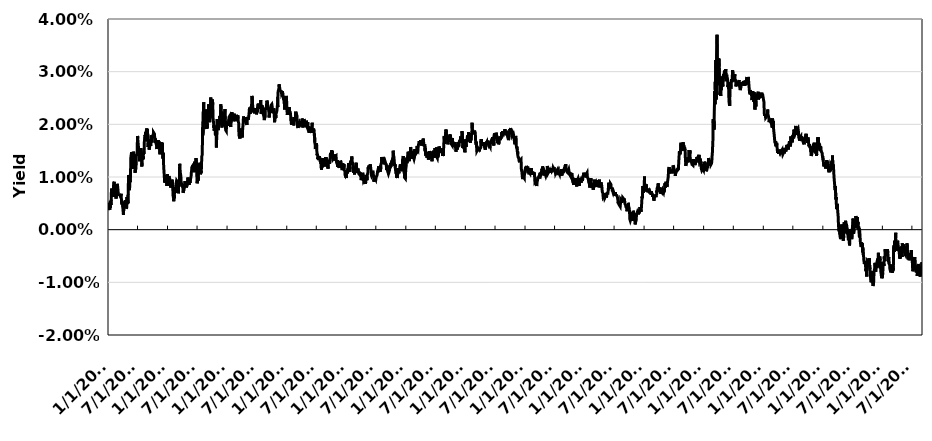
| Category | Spread |
|---|---|
| 1/4/10 | 0.004 |
| 1/5/10 | 0.005 |
| 1/6/10 | 0.004 |
| 1/7/10 | 0.004 |
| 1/8/10 | 0.005 |
| 1/11/10 | 0.004 |
| 1/12/10 | 0.005 |
| 1/13/10 | 0.004 |
| 1/14/10 | 0.005 |
| 1/15/10 | 0.005 |
| 1/19/10 | 0.005 |
| 1/20/10 | 0.006 |
| 1/21/10 | 0.007 |
| 1/22/10 | 0.008 |
| 1/25/10 | 0.007 |
| 1/26/10 | 0.007 |
| 1/27/10 | 0.007 |
| 1/28/10 | 0.008 |
| 1/29/10 | 0.008 |
| 2/1/10 | 0.007 |
| 2/2/10 | 0.006 |
| 2/3/10 | 0.006 |
| 2/4/10 | 0.008 |
| 2/5/10 | 0.009 |
| 2/8/10 | 0.009 |
| 2/9/10 | 0.008 |
| 2/10/10 | 0.008 |
| 2/11/10 | 0.008 |
| 2/12/10 | 0.008 |
| 2/16/10 | 0.008 |
| 2/17/10 | 0.007 |
| 2/18/10 | 0.006 |
| 2/19/10 | 0.006 |
| 2/22/10 | 0.006 |
| 2/23/10 | 0.007 |
| 2/24/10 | 0.007 |
| 2/25/10 | 0.008 |
| 2/26/10 | 0.009 |
| 3/1/10 | 0.008 |
| 3/2/10 | 0.008 |
| 3/3/10 | 0.008 |
| 3/4/10 | 0.008 |
| 3/5/10 | 0.007 |
| 3/8/10 | 0.006 |
| 3/9/10 | 0.007 |
| 3/10/10 | 0.006 |
| 3/11/10 | 0.006 |
| 3/12/10 | 0.007 |
| 3/15/10 | 0.006 |
| 3/16/10 | 0.006 |
| 3/17/10 | 0.006 |
| 3/18/10 | 0.006 |
| 3/19/10 | 0.006 |
| 3/22/10 | 0.007 |
| 3/23/10 | 0.006 |
| 3/24/10 | 0.005 |
| 3/25/10 | 0.005 |
| 3/26/10 | 0.005 |
| 3/29/10 | 0.005 |
| 3/30/10 | 0.005 |
| 3/31/10 | 0.005 |
| 4/1/10 | 0.004 |
| 4/5/10 | 0.003 |
| 4/6/10 | 0.003 |
| 4/7/10 | 0.004 |
| 4/8/10 | 0.004 |
| 4/9/10 | 0.004 |
| 4/12/10 | 0.004 |
| 4/13/10 | 0.005 |
| 4/14/10 | 0.004 |
| 4/15/10 | 0.004 |
| 4/16/10 | 0.006 |
| 4/19/10 | 0.005 |
| 4/20/10 | 0.005 |
| 4/21/10 | 0.005 |
| 4/22/10 | 0.005 |
| 4/23/10 | 0.004 |
| 4/26/10 | 0.004 |
| 4/27/10 | 0.006 |
| 4/28/10 | 0.005 |
| 4/29/10 | 0.005 |
| 4/30/10 | 0.006 |
| 5/3/10 | 0.005 |
| 5/4/10 | 0.007 |
| 5/5/10 | 0.008 |
| 5/6/10 | 0.01 |
| 5/7/10 | 0.01 |
| 5/10/10 | 0.008 |
| 5/11/10 | 0.008 |
| 5/12/10 | 0.008 |
| 5/13/10 | 0.008 |
| 5/14/10 | 0.009 |
| 5/17/10 | 0.009 |
| 5/18/10 | 0.01 |
| 5/19/10 | 0.011 |
| 5/20/10 | 0.013 |
| 5/21/10 | 0.014 |
| 5/24/10 | 0.014 |
| 5/25/10 | 0.015 |
| 5/26/10 | 0.015 |
| 5/27/10 | 0.012 |
| 5/28/10 | 0.013 |
| 6/1/10 | 0.014 |
| 6/2/10 | 0.012 |
| 6/3/10 | 0.012 |
| 6/4/10 | 0.015 |
| 6/7/10 | 0.015 |
| 6/8/10 | 0.014 |
| 6/9/10 | 0.014 |
| 6/10/10 | 0.012 |
| 6/11/10 | 0.013 |
| 6/14/10 | 0.012 |
| 6/15/10 | 0.011 |
| 6/16/10 | 0.011 |
| 6/17/10 | 0.011 |
| 6/18/10 | 0.011 |
| 6/21/10 | 0.011 |
| 6/22/10 | 0.013 |
| 6/23/10 | 0.014 |
| 6/24/10 | 0.014 |
| 6/25/10 | 0.014 |
| 6/28/10 | 0.015 |
| 6/29/10 | 0.016 |
| 6/30/10 | 0.017 |
| 7/1/10 | 0.018 |
| 7/2/10 | 0.017 |
| 7/6/10 | 0.017 |
| 7/7/10 | 0.015 |
| 7/8/10 | 0.015 |
| 7/9/10 | 0.014 |
| 7/12/10 | 0.014 |
| 7/13/10 | 0.013 |
| 7/14/10 | 0.014 |
| 7/15/10 | 0.014 |
| 7/16/10 | 0.015 |
| 7/19/10 | 0.014 |
| 7/20/10 | 0.014 |
| 7/21/10 | 0.016 |
| 7/22/10 | 0.014 |
| 7/23/10 | 0.014 |
| 7/26/10 | 0.013 |
| 7/27/10 | 0.012 |
| 7/28/10 | 0.013 |
| 7/29/10 | 0.014 |
| 7/30/10 | 0.015 |
| 8/2/10 | 0.013 |
| 8/3/10 | 0.014 |
| 8/4/10 | 0.013 |
| 8/5/10 | 0.014 |
| 8/6/10 | 0.015 |
| 8/9/10 | 0.014 |
| 8/10/10 | 0.015 |
| 8/11/10 | 0.017 |
| 8/12/10 | 0.017 |
| 8/13/10 | 0.017 |
| 8/16/10 | 0.018 |
| 8/17/10 | 0.017 |
| 8/18/10 | 0.017 |
| 8/19/10 | 0.018 |
| 8/20/10 | 0.018 |
| 8/23/10 | 0.018 |
| 8/24/10 | 0.019 |
| 8/25/10 | 0.019 |
| 8/26/10 | 0.019 |
| 8/27/10 | 0.017 |
| 8/30/10 | 0.019 |
| 8/31/10 | 0.019 |
| 9/1/10 | 0.017 |
| 9/2/10 | 0.017 |
| 9/3/10 | 0.016 |
| 9/7/10 | 0.017 |
| 9/8/10 | 0.017 |
| 9/9/10 | 0.015 |
| 9/10/10 | 0.015 |
| 9/13/10 | 0.016 |
| 9/14/10 | 0.016 |
| 9/15/10 | 0.016 |
| 9/16/10 | 0.016 |
| 9/17/10 | 0.016 |
| 9/20/10 | 0.016 |
| 9/21/10 | 0.017 |
| 9/22/10 | 0.017 |
| 9/23/10 | 0.018 |
| 9/24/10 | 0.017 |
| 9/27/10 | 0.017 |
| 9/28/10 | 0.018 |
| 9/29/10 | 0.018 |
| 9/30/10 | 0.018 |
| 10/1/10 | 0.017 |
| 10/4/10 | 0.018 |
| 10/5/10 | 0.017 |
| 10/6/10 | 0.018 |
| 10/7/10 | 0.018 |
| 10/8/10 | 0.018 |
| 10/12/10 | 0.018 |
| 10/13/10 | 0.018 |
| 10/14/10 | 0.017 |
| 10/15/10 | 0.016 |
| 10/18/10 | 0.017 |
| 10/19/10 | 0.017 |
| 10/20/10 | 0.017 |
| 10/21/10 | 0.016 |
| 10/22/10 | 0.016 |
| 10/25/10 | 0.017 |
| 10/26/10 | 0.016 |
| 10/27/10 | 0.015 |
| 10/28/10 | 0.016 |
| 10/29/10 | 0.016 |
| 11/1/10 | 0.016 |
| 11/2/10 | 0.016 |
| 11/3/10 | 0.016 |
| 11/4/10 | 0.017 |
| 11/5/10 | 0.017 |
| 11/8/10 | 0.017 |
| 11/9/10 | 0.016 |
| 11/10/10 | 0.017 |
| 11/11/10 | 0.017 |
| 11/12/10 | 0.016 |
| 11/15/10 | 0.014 |
| 11/16/10 | 0.016 |
| 11/17/10 | 0.015 |
| 11/18/10 | 0.015 |
| 11/19/10 | 0.015 |
| 11/22/10 | 0.016 |
| 11/23/10 | 0.017 |
| 11/24/10 | 0.015 |
| 11/26/10 | 0.016 |
| 11/29/10 | 0.016 |
| 11/30/10 | 0.016 |
| 12/1/10 | 0.014 |
| 12/2/10 | 0.014 |
| 12/3/10 | 0.014 |
| 12/6/10 | 0.015 |
| 12/7/10 | 0.013 |
| 12/8/10 | 0.012 |
| 12/9/10 | 0.012 |
| 12/10/10 | 0.011 |
| 12/13/10 | 0.011 |
| 12/14/10 | 0.009 |
| 12/15/10 | 0.009 |
| 12/16/10 | 0.009 |
| 12/17/10 | 0.01 |
| 12/20/10 | 0.01 |
| 12/21/10 | 0.01 |
| 12/22/10 | 0.01 |
| 12/23/10 | 0.009 |
| 12/27/10 | 0.01 |
| 12/28/10 | 0.008 |
| 12/29/10 | 0.01 |
| 12/30/10 | 0.01 |
| 12/31/10 | 0.01 |
| 1/3/11 | 0.01 |
| 1/4/11 | 0.01 |
| 1/5/11 | 0.008 |
| 1/6/11 | 0.009 |
| 1/7/11 | 0.01 |
| 1/10/11 | 0.01 |
| 1/11/11 | 0.01 |
| 1/12/11 | 0.009 |
| 1/13/11 | 0.01 |
| 1/14/11 | 0.009 |
| 1/18/11 | 0.009 |
| 1/19/11 | 0.009 |
| 1/20/11 | 0.008 |
| 1/21/11 | 0.008 |
| 1/24/11 | 0.008 |
| 1/25/11 | 0.009 |
| 1/26/11 | 0.008 |
| 1/27/11 | 0.008 |
| 1/28/11 | 0.01 |
| 1/31/11 | 0.009 |
| 2/1/11 | 0.008 |
| 2/2/11 | 0.008 |
| 2/3/11 | 0.007 |
| 2/4/11 | 0.006 |
| 2/7/11 | 0.006 |
| 2/8/11 | 0.005 |
| 2/9/11 | 0.006 |
| 2/10/11 | 0.006 |
| 2/11/11 | 0.007 |
| 2/14/11 | 0.007 |
| 2/15/11 | 0.007 |
| 2/16/11 | 0.007 |
| 2/17/11 | 0.008 |
| 2/18/11 | 0.007 |
| 2/22/11 | 0.009 |
| 2/23/11 | 0.009 |
| 2/24/11 | 0.009 |
| 2/25/11 | 0.009 |
| 2/28/11 | 0.009 |
| 3/1/11 | 0.009 |
| 3/2/11 | 0.009 |
| 3/3/11 | 0.007 |
| 3/4/11 | 0.008 |
| 3/7/11 | 0.008 |
| 3/8/11 | 0.007 |
| 3/9/11 | 0.007 |
| 3/10/11 | 0.009 |
| 3/11/11 | 0.008 |
| 3/14/11 | 0.009 |
| 3/15/11 | 0.011 |
| 3/16/11 | 0.012 |
| 3/17/11 | 0.012 |
| 3/18/11 | 0.012 |
| 3/21/11 | 0.01 |
| 3/22/11 | 0.01 |
| 3/23/11 | 0.01 |
| 3/24/11 | 0.01 |
| 3/25/11 | 0.009 |
| 3/28/11 | 0.009 |
| 3/29/11 | 0.008 |
| 3/30/11 | 0.008 |
| 3/31/11 | 0.008 |
| 4/1/11 | 0.008 |
| 4/4/11 | 0.008 |
| 4/5/11 | 0.008 |
| 4/6/11 | 0.007 |
| 4/7/11 | 0.007 |
| 4/8/11 | 0.007 |
| 4/11/11 | 0.008 |
| 4/12/11 | 0.008 |
| 4/13/11 | 0.009 |
| 4/14/11 | 0.008 |
| 4/15/11 | 0.008 |
| 4/18/11 | 0.009 |
| 4/19/11 | 0.009 |
| 4/20/11 | 0.008 |
| 4/21/11 | 0.008 |
| 4/25/11 | 0.009 |
| 4/26/11 | 0.009 |
| 4/27/11 | 0.008 |
| 4/28/11 | 0.008 |
| 4/29/11 | 0.008 |
| 5/2/11 | 0.008 |
| 5/3/11 | 0.008 |
| 5/4/11 | 0.009 |
| 5/5/11 | 0.01 |
| 5/6/11 | 0.01 |
| 5/9/11 | 0.01 |
| 5/10/11 | 0.009 |
| 5/11/11 | 0.009 |
| 5/12/11 | 0.008 |
| 5/13/11 | 0.009 |
| 5/16/11 | 0.009 |
| 5/17/11 | 0.009 |
| 5/18/11 | 0.009 |
| 5/19/11 | 0.009 |
| 5/20/11 | 0.009 |
| 5/23/11 | 0.01 |
| 5/24/11 | 0.01 |
| 5/25/11 | 0.01 |
| 5/26/11 | 0.011 |
| 5/27/11 | 0.011 |
| 5/31/11 | 0.011 |
| 6/1/11 | 0.012 |
| 6/2/11 | 0.011 |
| 6/3/11 | 0.012 |
| 6/6/11 | 0.012 |
| 6/7/11 | 0.012 |
| 6/8/11 | 0.012 |
| 6/9/11 | 0.012 |
| 6/10/11 | 0.012 |
| 6/13/11 | 0.012 |
| 6/14/11 | 0.011 |
| 6/15/11 | 0.013 |
| 6/16/11 | 0.013 |
| 6/17/11 | 0.013 |
| 6/20/11 | 0.012 |
| 6/21/11 | 0.012 |
| 6/22/11 | 0.012 |
| 6/23/11 | 0.013 |
| 6/24/11 | 0.014 |
| 6/27/11 | 0.012 |
| 6/28/11 | 0.011 |
| 6/29/11 | 0.01 |
| 6/30/11 | 0.01 |
| 7/1/11 | 0.009 |
| 7/5/11 | 0.01 |
| 7/6/11 | 0.01 |
| 7/7/11 | 0.009 |
| 7/8/11 | 0.011 |
| 7/11/11 | 0.012 |
| 7/12/11 | 0.012 |
| 7/13/11 | 0.012 |
| 7/14/11 | 0.012 |
| 7/15/11 | 0.012 |
| 7/18/11 | 0.013 |
| 7/19/11 | 0.013 |
| 7/20/11 | 0.012 |
| 7/21/11 | 0.011 |
| 7/22/11 | 0.011 |
| 7/25/11 | 0.011 |
| 7/26/11 | 0.011 |
| 7/27/11 | 0.011 |
| 7/28/11 | 0.012 |
| 7/29/11 | 0.014 |
| 8/1/11 | 0.014 |
| 8/2/11 | 0.016 |
| 8/3/11 | 0.016 |
| 8/4/11 | 0.019 |
| 8/5/11 | 0.018 |
| 8/8/11 | 0.022 |
| 8/9/11 | 0.023 |
| 8/10/11 | 0.024 |
| 8/11/11 | 0.021 |
| 8/12/11 | 0.022 |
| 8/15/11 | 0.02 |
| 8/16/11 | 0.021 |
| 8/17/11 | 0.021 |
| 8/18/11 | 0.022 |
| 8/19/11 | 0.023 |
| 8/22/11 | 0.022 |
| 8/23/11 | 0.021 |
| 8/24/11 | 0.019 |
| 8/25/11 | 0.02 |
| 8/26/11 | 0.021 |
| 8/29/11 | 0.019 |
| 8/30/11 | 0.02 |
| 8/31/11 | 0.019 |
| 9/1/11 | 0.02 |
| 9/2/11 | 0.022 |
| 9/6/11 | 0.023 |
| 9/7/11 | 0.022 |
| 9/8/11 | 0.022 |
| 9/9/11 | 0.024 |
| 9/12/11 | 0.023 |
| 9/13/11 | 0.023 |
| 9/14/11 | 0.022 |
| 9/15/11 | 0.021 |
| 9/16/11 | 0.02 |
| 9/19/11 | 0.022 |
| 9/20/11 | 0.021 |
| 9/21/11 | 0.023 |
| 9/22/11 | 0.025 |
| 9/23/11 | 0.024 |
| 9/26/11 | 0.022 |
| 9/27/11 | 0.022 |
| 9/28/11 | 0.022 |
| 9/29/11 | 0.021 |
| 9/30/11 | 0.023 |
| 10/3/11 | 0.025 |
| 10/4/11 | 0.025 |
| 10/5/11 | 0.024 |
| 10/6/11 | 0.022 |
| 10/7/11 | 0.021 |
| 10/11/11 | 0.02 |
| 10/12/11 | 0.019 |
| 10/13/11 | 0.02 |
| 10/14/11 | 0.019 |
| 10/17/11 | 0.02 |
| 10/18/11 | 0.019 |
| 10/19/11 | 0.019 |
| 10/20/11 | 0.019 |
| 10/21/11 | 0.018 |
| 10/24/11 | 0.018 |
| 10/25/11 | 0.019 |
| 10/26/11 | 0.018 |
| 10/27/11 | 0.016 |
| 10/28/11 | 0.017 |
| 10/31/11 | 0.019 |
| 11/1/11 | 0.021 |
| 11/2/11 | 0.02 |
| 11/3/11 | 0.019 |
| 11/4/11 | 0.02 |
| 11/7/11 | 0.02 |
| 11/8/11 | 0.019 |
| 11/9/11 | 0.021 |
| 11/10/11 | 0.02 |
| 11/14/11 | 0.02 |
| 11/15/11 | 0.02 |
| 11/16/11 | 0.021 |
| 11/17/11 | 0.022 |
| 11/18/11 | 0.021 |
| 11/21/11 | 0.022 |
| 11/22/11 | 0.023 |
| 11/23/11 | 0.024 |
| 11/25/11 | 0.023 |
| 11/28/11 | 0.022 |
| 11/29/11 | 0.021 |
| 11/30/11 | 0.02 |
| 12/1/11 | 0.019 |
| 12/2/11 | 0.02 |
| 12/5/11 | 0.02 |
| 12/6/11 | 0.02 |
| 12/7/11 | 0.02 |
| 12/8/11 | 0.021 |
| 12/9/11 | 0.02 |
| 12/12/11 | 0.021 |
| 12/13/11 | 0.021 |
| 12/14/11 | 0.022 |
| 12/15/11 | 0.021 |
| 12/16/11 | 0.022 |
| 12/19/11 | 0.023 |
| 12/20/11 | 0.021 |
| 12/21/11 | 0.02 |
| 12/22/11 | 0.02 |
| 12/23/11 | 0.019 |
| 12/27/11 | 0.019 |
| 12/28/11 | 0.02 |
| 12/29/11 | 0.02 |
| 12/30/11 | 0.02 |
| 1/3/12 | 0.02 |
| 1/4/12 | 0.02 |
| 1/5/12 | 0.02 |
| 1/6/12 | 0.02 |
| 1/9/12 | 0.02 |
| 1/10/12 | 0.02 |
| 1/11/12 | 0.021 |
| 1/12/12 | 0.021 |
| 1/13/12 | 0.021 |
| 1/17/12 | 0.022 |
| 1/18/12 | 0.021 |
| 1/19/12 | 0.021 |
| 1/20/12 | 0.02 |
| 1/23/12 | 0.02 |
| 1/24/12 | 0.02 |
| 1/25/12 | 0.02 |
| 1/26/12 | 0.02 |
| 1/27/12 | 0.021 |
| 1/30/12 | 0.022 |
| 1/31/12 | 0.022 |
| 2/1/12 | 0.022 |
| 2/2/12 | 0.022 |
| 2/3/12 | 0.021 |
| 2/6/12 | 0.022 |
| 2/7/12 | 0.021 |
| 2/8/12 | 0.021 |
| 2/9/12 | 0.021 |
| 2/10/12 | 0.022 |
| 2/13/12 | 0.021 |
| 2/14/12 | 0.022 |
| 2/15/12 | 0.022 |
| 2/16/12 | 0.021 |
| 2/17/12 | 0.021 |
| 2/21/12 | 0.021 |
| 2/22/12 | 0.021 |
| 2/23/12 | 0.021 |
| 2/24/12 | 0.021 |
| 2/27/12 | 0.022 |
| 2/28/12 | 0.022 |
| 2/29/12 | 0.022 |
| 3/1/12 | 0.021 |
| 3/2/12 | 0.021 |
| 3/5/12 | 0.021 |
| 3/6/12 | 0.022 |
| 3/7/12 | 0.022 |
| 3/8/12 | 0.021 |
| 3/9/12 | 0.021 |
| 3/12/12 | 0.02 |
| 3/13/12 | 0.019 |
| 3/14/12 | 0.018 |
| 3/15/12 | 0.018 |
| 3/16/12 | 0.018 |
| 3/19/12 | 0.017 |
| 3/20/12 | 0.017 |
| 3/21/12 | 0.018 |
| 3/22/12 | 0.018 |
| 3/23/12 | 0.019 |
| 3/26/12 | 0.018 |
| 3/27/12 | 0.019 |
| 3/28/12 | 0.019 |
| 3/29/12 | 0.019 |
| 3/30/12 | 0.018 |
| 4/2/12 | 0.018 |
| 4/3/12 | 0.018 |
| 4/4/12 | 0.018 |
| 4/5/12 | 0.019 |
| 4/9/12 | 0.021 |
| 4/10/12 | 0.022 |
| 4/11/12 | 0.021 |
| 4/12/12 | 0.02 |
| 4/13/12 | 0.021 |
| 4/16/12 | 0.021 |
| 4/17/12 | 0.021 |
| 4/18/12 | 0.021 |
| 4/19/12 | 0.021 |
| 4/20/12 | 0.021 |
| 4/23/12 | 0.021 |
| 4/24/12 | 0.021 |
| 4/25/12 | 0.02 |
| 4/26/12 | 0.02 |
| 4/27/12 | 0.02 |
| 4/30/12 | 0.02 |
| 5/1/12 | 0.02 |
| 5/2/12 | 0.02 |
| 5/3/12 | 0.021 |
| 5/4/12 | 0.021 |
| 5/7/12 | 0.021 |
| 5/8/12 | 0.021 |
| 5/9/12 | 0.021 |
| 5/10/12 | 0.021 |
| 5/11/12 | 0.021 |
| 5/14/12 | 0.022 |
| 5/15/12 | 0.022 |
| 5/16/12 | 0.022 |
| 5/17/12 | 0.023 |
| 5/18/12 | 0.023 |
| 5/21/12 | 0.023 |
| 5/22/12 | 0.022 |
| 5/23/12 | 0.023 |
| 5/24/12 | 0.022 |
| 5/25/12 | 0.022 |
| 5/29/12 | 0.022 |
| 5/30/12 | 0.024 |
| 5/31/12 | 0.024 |
| 6/1/12 | 0.025 |
| 6/4/12 | 0.025 |
| 6/5/12 | 0.024 |
| 6/6/12 | 0.023 |
| 6/7/12 | 0.023 |
| 6/8/12 | 0.022 |
| 6/11/12 | 0.023 |
| 6/12/12 | 0.022 |
| 6/13/12 | 0.023 |
| 6/14/12 | 0.022 |
| 6/15/12 | 0.022 |
| 6/18/12 | 0.022 |
| 6/19/12 | 0.022 |
| 6/20/12 | 0.022 |
| 6/21/12 | 0.023 |
| 6/22/12 | 0.022 |
| 6/25/12 | 0.023 |
| 6/26/12 | 0.023 |
| 6/27/12 | 0.022 |
| 6/28/12 | 0.023 |
| 6/29/12 | 0.022 |
| 7/2/12 | 0.023 |
| 7/3/12 | 0.022 |
| 7/5/12 | 0.023 |
| 7/6/12 | 0.023 |
| 7/9/12 | 0.024 |
| 7/10/12 | 0.024 |
| 7/11/12 | 0.024 |
| 7/12/12 | 0.024 |
| 7/13/12 | 0.023 |
| 7/16/12 | 0.024 |
| 7/17/12 | 0.023 |
| 7/18/12 | 0.023 |
| 7/19/12 | 0.023 |
| 7/20/12 | 0.023 |
| 7/23/12 | 0.024 |
| 7/24/12 | 0.024 |
| 7/25/12 | 0.025 |
| 7/26/12 | 0.024 |
| 7/27/12 | 0.022 |
| 7/30/12 | 0.022 |
| 7/31/12 | 0.023 |
| 8/1/12 | 0.023 |
| 8/2/12 | 0.024 |
| 8/3/12 | 0.022 |
| 8/6/12 | 0.022 |
| 8/7/12 | 0.022 |
| 8/8/12 | 0.022 |
| 8/9/12 | 0.022 |
| 8/10/12 | 0.022 |
| 8/13/12 | 0.022 |
| 8/14/12 | 0.022 |
| 8/15/12 | 0.021 |
| 8/16/12 | 0.021 |
| 8/17/12 | 0.021 |
| 8/20/12 | 0.021 |
| 8/21/12 | 0.021 |
| 8/22/12 | 0.022 |
| 8/23/12 | 0.023 |
| 8/24/12 | 0.023 |
| 8/27/12 | 0.023 |
| 8/28/12 | 0.023 |
| 8/29/12 | 0.023 |
| 8/30/12 | 0.024 |
| 8/31/12 | 0.024 |
| 9/4/12 | 0.024 |
| 9/5/12 | 0.024 |
| 9/6/12 | 0.023 |
| 9/7/12 | 0.023 |
| 9/10/12 | 0.023 |
| 9/11/12 | 0.023 |
| 9/12/12 | 0.023 |
| 9/13/12 | 0.022 |
| 9/14/12 | 0.021 |
| 9/17/12 | 0.022 |
| 9/18/12 | 0.022 |
| 9/19/12 | 0.023 |
| 9/20/12 | 0.022 |
| 9/21/12 | 0.023 |
| 9/24/12 | 0.023 |
| 9/25/12 | 0.023 |
| 9/26/12 | 0.024 |
| 9/27/12 | 0.024 |
| 9/28/12 | 0.024 |
| 10/1/12 | 0.024 |
| 10/2/12 | 0.024 |
| 10/3/12 | 0.023 |
| 10/4/12 | 0.023 |
| 10/5/12 | 0.022 |
| 10/9/12 | 0.022 |
| 10/10/12 | 0.022 |
| 10/11/12 | 0.023 |
| 10/12/12 | 0.023 |
| 10/15/12 | 0.023 |
| 10/16/12 | 0.022 |
| 10/17/12 | 0.021 |
| 10/18/12 | 0.02 |
| 10/19/12 | 0.021 |
| 10/22/12 | 0.021 |
| 10/23/12 | 0.022 |
| 10/24/12 | 0.022 |
| 10/25/12 | 0.021 |
| 10/26/12 | 0.022 |
| 10/31/12 | 0.022 |
| 11/1/12 | 0.023 |
| 11/2/12 | 0.023 |
| 11/5/12 | 0.024 |
| 11/6/12 | 0.023 |
| 11/7/12 | 0.025 |
| 11/8/12 | 0.026 |
| 11/9/12 | 0.026 |
| 11/13/12 | 0.027 |
| 11/14/12 | 0.027 |
| 11/15/12 | 0.028 |
| 11/16/12 | 0.027 |
| 11/19/12 | 0.027 |
| 11/20/12 | 0.026 |
| 11/21/12 | 0.026 |
| 11/23/12 | 0.026 |
| 11/26/12 | 0.026 |
| 11/27/12 | 0.026 |
| 11/28/12 | 0.026 |
| 11/29/12 | 0.026 |
| 11/30/12 | 0.026 |
| 12/3/12 | 0.026 |
| 12/4/12 | 0.026 |
| 12/5/12 | 0.026 |
| 12/6/12 | 0.026 |
| 12/7/12 | 0.026 |
| 12/10/12 | 0.026 |
| 12/11/12 | 0.025 |
| 12/12/12 | 0.025 |
| 12/13/12 | 0.025 |
| 12/14/12 | 0.025 |
| 12/17/12 | 0.024 |
| 12/18/12 | 0.023 |
| 12/19/12 | 0.023 |
| 12/20/12 | 0.023 |
| 12/21/12 | 0.024 |
| 12/24/12 | 0.024 |
| 12/26/12 | 0.024 |
| 12/27/12 | 0.025 |
| 12/28/12 | 0.025 |
| 12/31/12 | 0.024 |
| 1/2/13 | 0.023 |
| 1/3/13 | 0.022 |
| 1/4/13 | 0.022 |
| 1/7/13 | 0.022 |
| 1/8/13 | 0.023 |
| 1/9/13 | 0.023 |
| 1/10/13 | 0.022 |
| 1/11/13 | 0.023 |
| 1/14/13 | 0.023 |
| 1/15/13 | 0.023 |
| 1/16/13 | 0.023 |
| 1/17/13 | 0.023 |
| 1/18/13 | 0.022 |
| 1/22/13 | 0.022 |
| 1/23/13 | 0.022 |
| 1/24/13 | 0.022 |
| 1/25/13 | 0.021 |
| 1/28/13 | 0.021 |
| 1/29/13 | 0.02 |
| 1/30/13 | 0.02 |
| 1/31/13 | 0.02 |
| 2/1/13 | 0.02 |
| 2/4/13 | 0.021 |
| 2/5/13 | 0.02 |
| 2/6/13 | 0.02 |
| 2/7/13 | 0.02 |
| 2/8/13 | 0.02 |
| 2/11/13 | 0.02 |
| 2/12/13 | 0.02 |
| 2/13/13 | 0.02 |
| 2/14/13 | 0.021 |
| 2/15/13 | 0.021 |
| 2/19/13 | 0.021 |
| 2/20/13 | 0.021 |
| 2/21/13 | 0.021 |
| 2/22/13 | 0.021 |
| 2/25/13 | 0.022 |
| 2/26/13 | 0.022 |
| 2/27/13 | 0.022 |
| 2/28/13 | 0.022 |
| 3/1/13 | 0.022 |
| 3/4/13 | 0.021 |
| 3/5/13 | 0.021 |
| 3/6/13 | 0.021 |
| 3/7/13 | 0.02 |
| 3/8/13 | 0.02 |
| 3/11/13 | 0.019 |
| 3/12/13 | 0.02 |
| 3/13/13 | 0.02 |
| 3/14/13 | 0.02 |
| 3/15/13 | 0.02 |
| 3/18/13 | 0.02 |
| 3/19/13 | 0.021 |
| 3/20/13 | 0.02 |
| 3/21/13 | 0.02 |
| 3/22/13 | 0.02 |
| 3/25/13 | 0.021 |
| 3/26/13 | 0.02 |
| 3/27/13 | 0.021 |
| 3/28/13 | 0.02 |
| 4/1/13 | 0.02 |
| 4/2/13 | 0.02 |
| 4/3/13 | 0.02 |
| 4/4/13 | 0.021 |
| 4/5/13 | 0.021 |
| 4/8/13 | 0.02 |
| 4/9/13 | 0.02 |
| 4/10/13 | 0.019 |
| 4/11/13 | 0.019 |
| 4/12/13 | 0.02 |
| 4/15/13 | 0.021 |
| 4/16/13 | 0.02 |
| 4/17/13 | 0.021 |
| 4/18/13 | 0.021 |
| 4/19/13 | 0.02 |
| 4/22/13 | 0.02 |
| 4/23/13 | 0.02 |
| 4/24/13 | 0.02 |
| 4/25/13 | 0.02 |
| 4/26/13 | 0.02 |
| 4/29/13 | 0.02 |
| 4/30/13 | 0.02 |
| 5/1/13 | 0.02 |
| 5/2/13 | 0.021 |
| 5/3/13 | 0.02 |
| 5/6/13 | 0.02 |
| 5/7/13 | 0.019 |
| 5/8/13 | 0.02 |
| 5/9/13 | 0.02 |
| 5/10/13 | 0.019 |
| 5/13/13 | 0.019 |
| 5/14/13 | 0.019 |
| 5/15/13 | 0.019 |
| 5/16/13 | 0.02 |
| 5/17/13 | 0.018 |
| 5/20/13 | 0.018 |
| 5/21/13 | 0.019 |
| 5/22/13 | 0.018 |
| 5/23/13 | 0.019 |
| 5/24/13 | 0.019 |
| 5/28/13 | 0.018 |
| 5/29/13 | 0.019 |
| 5/30/13 | 0.019 |
| 5/31/13 | 0.019 |
| 6/3/13 | 0.019 |
| 6/4/13 | 0.019 |
| 6/5/13 | 0.02 |
| 6/6/13 | 0.02 |
| 6/7/13 | 0.019 |
| 6/10/13 | 0.018 |
| 6/11/13 | 0.019 |
| 6/12/13 | 0.019 |
| 6/13/13 | 0.019 |
| 6/14/13 | 0.019 |
| 6/17/13 | 0.019 |
| 6/18/13 | 0.018 |
| 6/19/13 | 0.018 |
| 6/20/13 | 0.018 |
| 6/21/13 | 0.017 |
| 6/24/13 | 0.016 |
| 6/25/13 | 0.015 |
| 6/26/13 | 0.015 |
| 6/27/13 | 0.016 |
| 6/28/13 | 0.015 |
| 7/1/13 | 0.016 |
| 7/2/13 | 0.016 |
| 7/3/13 | 0.016 |
| 7/5/13 | 0.014 |
| 7/8/13 | 0.014 |
| 7/9/13 | 0.014 |
| 7/10/13 | 0.013 |
| 7/11/13 | 0.014 |
| 7/12/13 | 0.013 |
| 7/15/13 | 0.013 |
| 7/16/13 | 0.014 |
| 7/17/13 | 0.014 |
| 7/18/13 | 0.013 |
| 7/19/13 | 0.014 |
| 7/22/13 | 0.014 |
| 7/23/13 | 0.014 |
| 7/24/13 | 0.013 |
| 7/25/13 | 0.013 |
| 7/26/13 | 0.013 |
| 7/29/13 | 0.013 |
| 7/30/13 | 0.012 |
| 7/31/13 | 0.013 |
| 8/1/13 | 0.011 |
| 8/2/13 | 0.013 |
| 8/5/13 | 0.012 |
| 8/6/13 | 0.013 |
| 8/7/13 | 0.013 |
| 8/8/13 | 0.013 |
| 8/9/13 | 0.014 |
| 8/12/13 | 0.013 |
| 8/13/13 | 0.012 |
| 8/14/13 | 0.013 |
| 8/15/13 | 0.013 |
| 8/16/13 | 0.012 |
| 8/19/13 | 0.012 |
| 8/20/13 | 0.013 |
| 8/21/13 | 0.013 |
| 8/22/13 | 0.012 |
| 8/23/13 | 0.012 |
| 8/26/13 | 0.013 |
| 8/27/13 | 0.014 |
| 8/28/13 | 0.013 |
| 8/29/13 | 0.014 |
| 8/30/13 | 0.013 |
| 9/3/13 | 0.013 |
| 9/4/13 | 0.013 |
| 9/5/13 | 0.012 |
| 9/6/13 | 0.012 |
| 9/9/13 | 0.013 |
| 9/10/13 | 0.012 |
| 9/11/13 | 0.012 |
| 9/12/13 | 0.013 |
| 9/13/13 | 0.013 |
| 9/16/13 | 0.013 |
| 9/17/13 | 0.013 |
| 9/18/13 | 0.013 |
| 9/19/13 | 0.012 |
| 9/20/13 | 0.013 |
| 9/23/13 | 0.013 |
| 9/24/13 | 0.014 |
| 9/25/13 | 0.014 |
| 9/26/13 | 0.014 |
| 9/27/13 | 0.015 |
| 9/30/13 | 0.015 |
| 10/1/13 | 0.014 |
| 10/2/13 | 0.015 |
| 10/3/13 | 0.015 |
| 10/4/13 | 0.015 |
| 10/7/13 | 0.015 |
| 10/8/13 | 0.015 |
| 10/9/13 | 0.014 |
| 10/10/13 | 0.013 |
| 10/11/13 | 0.013 |
| 10/15/13 | 0.013 |
| 10/16/13 | 0.014 |
| 10/17/13 | 0.014 |
| 10/18/13 | 0.014 |
| 10/21/13 | 0.014 |
| 10/22/13 | 0.014 |
| 10/23/13 | 0.014 |
| 10/24/13 | 0.014 |
| 10/25/13 | 0.014 |
| 10/28/13 | 0.014 |
| 10/29/13 | 0.014 |
| 10/30/13 | 0.014 |
| 10/31/13 | 0.014 |
| 11/1/13 | 0.013 |
| 11/4/13 | 0.013 |
| 11/5/13 | 0.013 |
| 11/6/13 | 0.012 |
| 11/7/13 | 0.013 |
| 11/8/13 | 0.012 |
| 11/12/13 | 0.012 |
| 11/13/13 | 0.012 |
| 11/14/13 | 0.012 |
| 11/15/13 | 0.012 |
| 11/18/13 | 0.012 |
| 11/19/13 | 0.012 |
| 11/20/13 | 0.012 |
| 11/21/13 | 0.012 |
| 11/22/13 | 0.012 |
| 11/25/13 | 0.012 |
| 11/26/13 | 0.013 |
| 11/27/13 | 0.013 |
| 11/29/13 | 0.013 |
| 12/2/13 | 0.012 |
| 12/3/13 | 0.012 |
| 12/4/13 | 0.012 |
| 12/5/13 | 0.012 |
| 12/6/13 | 0.011 |
| 12/9/13 | 0.012 |
| 12/10/13 | 0.013 |
| 12/11/13 | 0.013 |
| 12/12/13 | 0.012 |
| 12/13/13 | 0.012 |
| 12/16/13 | 0.012 |
| 12/17/13 | 0.012 |
| 12/18/13 | 0.011 |
| 12/19/13 | 0.011 |
| 12/20/13 | 0.011 |
| 12/23/13 | 0.011 |
| 12/24/13 | 0.01 |
| 12/26/13 | 0.011 |
| 12/27/13 | 0.01 |
| 12/30/13 | 0.01 |
| 12/31/13 | 0.01 |
| 1/2/14 | 0.011 |
| 1/3/14 | 0.011 |
| 1/6/14 | 0.011 |
| 1/7/14 | 0.011 |
| 1/8/14 | 0.011 |
| 1/9/14 | 0.011 |
| 1/10/14 | 0.011 |
| 1/13/14 | 0.012 |
| 1/14/14 | 0.013 |
| 1/15/14 | 0.011 |
| 1/16/14 | 0.012 |
| 1/17/14 | 0.012 |
| 1/21/14 | 0.011 |
| 1/22/14 | 0.011 |
| 1/23/14 | 0.012 |
| 1/24/14 | 0.013 |
| 1/27/14 | 0.012 |
| 1/28/14 | 0.012 |
| 1/29/14 | 0.013 |
| 1/30/14 | 0.012 |
| 1/31/14 | 0.012 |
| 2/3/14 | 0.014 |
| 2/4/14 | 0.014 |
| 2/5/14 | 0.013 |
| 2/6/14 | 0.013 |
| 2/7/14 | 0.013 |
| 2/10/14 | 0.013 |
| 2/11/14 | 0.012 |
| 2/12/14 | 0.011 |
| 2/13/14 | 0.011 |
| 2/14/14 | 0.011 |
| 2/18/14 | 0.011 |
| 2/19/14 | 0.011 |
| 2/20/14 | 0.011 |
| 2/21/14 | 0.011 |
| 2/24/14 | 0.011 |
| 2/25/14 | 0.011 |
| 2/26/14 | 0.012 |
| 2/27/14 | 0.012 |
| 2/28/14 | 0.012 |
| 3/3/14 | 0.013 |
| 3/4/14 | 0.011 |
| 3/5/14 | 0.012 |
| 3/6/14 | 0.012 |
| 3/7/14 | 0.011 |
| 3/10/14 | 0.011 |
| 3/11/14 | 0.011 |
| 3/12/14 | 0.011 |
| 3/13/14 | 0.012 |
| 3/14/14 | 0.012 |
| 3/17/14 | 0.011 |
| 3/18/14 | 0.011 |
| 3/19/14 | 0.011 |
| 3/20/14 | 0.01 |
| 3/21/14 | 0.011 |
| 3/24/14 | 0.011 |
| 3/25/14 | 0.01 |
| 3/26/14 | 0.011 |
| 3/27/14 | 0.011 |
| 3/28/14 | 0.01 |
| 3/31/14 | 0.01 |
| 4/1/14 | 0.01 |
| 4/2/14 | 0.009 |
| 4/3/14 | 0.01 |
| 4/4/14 | 0.01 |
| 4/7/14 | 0.01 |
| 4/8/14 | 0.01 |
| 4/9/14 | 0.01 |
| 4/10/14 | 0.011 |
| 4/11/14 | 0.011 |
| 4/14/14 | 0.01 |
| 4/15/14 | 0.01 |
| 4/16/14 | 0.01 |
| 4/17/14 | 0.009 |
| 4/21/14 | 0.009 |
| 4/22/14 | 0.009 |
| 4/23/14 | 0.009 |
| 4/24/14 | 0.009 |
| 4/25/14 | 0.009 |
| 4/28/14 | 0.009 |
| 4/29/14 | 0.009 |
| 4/30/14 | 0.009 |
| 5/1/14 | 0.009 |
| 5/2/14 | 0.01 |
| 5/5/14 | 0.01 |
| 5/6/14 | 0.01 |
| 5/7/14 | 0.009 |
| 5/8/14 | 0.01 |
| 5/9/14 | 0.01 |
| 5/12/14 | 0.01 |
| 5/13/14 | 0.011 |
| 5/14/14 | 0.011 |
| 5/15/14 | 0.012 |
| 5/16/14 | 0.012 |
| 5/19/14 | 0.012 |
| 5/20/14 | 0.012 |
| 5/21/14 | 0.012 |
| 5/22/14 | 0.012 |
| 5/23/14 | 0.012 |
| 5/27/14 | 0.012 |
| 5/28/14 | 0.012 |
| 5/29/14 | 0.012 |
| 5/30/14 | 0.012 |
| 6/2/14 | 0.011 |
| 6/3/14 | 0.01 |
| 6/4/14 | 0.01 |
| 6/5/14 | 0.01 |
| 6/6/14 | 0.01 |
| 6/9/14 | 0.01 |
| 6/10/14 | 0.01 |
| 6/11/14 | 0.011 |
| 6/12/14 | 0.011 |
| 6/13/14 | 0.011 |
| 6/16/14 | 0.01 |
| 6/17/14 | 0.01 |
| 6/18/14 | 0.01 |
| 6/19/14 | 0.009 |
| 6/20/14 | 0.009 |
| 6/23/14 | 0.009 |
| 6/24/14 | 0.01 |
| 6/25/14 | 0.01 |
| 6/26/14 | 0.01 |
| 6/27/14 | 0.01 |
| 6/30/14 | 0.01 |
| 7/1/14 | 0.01 |
| 7/2/14 | 0.01 |
| 7/3/14 | 0.01 |
| 7/7/14 | 0.01 |
| 7/8/14 | 0.01 |
| 7/9/14 | 0.011 |
| 7/10/14 | 0.011 |
| 7/11/14 | 0.011 |
| 7/14/14 | 0.011 |
| 7/15/14 | 0.011 |
| 7/16/14 | 0.011 |
| 7/17/14 | 0.012 |
| 7/18/14 | 0.011 |
| 7/21/14 | 0.012 |
| 7/22/14 | 0.012 |
| 7/23/14 | 0.012 |
| 7/24/14 | 0.011 |
| 7/25/14 | 0.012 |
| 7/28/14 | 0.011 |
| 7/29/14 | 0.012 |
| 7/30/14 | 0.011 |
| 7/31/14 | 0.012 |
| 8/1/14 | 0.012 |
| 8/4/14 | 0.013 |
| 8/5/14 | 0.013 |
| 8/6/14 | 0.014 |
| 8/7/14 | 0.014 |
| 8/8/14 | 0.013 |
| 8/11/14 | 0.013 |
| 8/12/14 | 0.013 |
| 8/13/14 | 0.013 |
| 8/14/14 | 0.013 |
| 8/15/14 | 0.014 |
| 8/18/14 | 0.013 |
| 8/19/14 | 0.013 |
| 8/20/14 | 0.012 |
| 8/21/14 | 0.012 |
| 8/22/14 | 0.013 |
| 8/25/14 | 0.013 |
| 8/26/14 | 0.013 |
| 8/27/14 | 0.013 |
| 8/28/14 | 0.013 |
| 8/29/14 | 0.013 |
| 9/2/14 | 0.012 |
| 9/3/14 | 0.012 |
| 9/4/14 | 0.012 |
| 9/5/14 | 0.011 |
| 9/8/14 | 0.011 |
| 9/9/14 | 0.012 |
| 9/10/14 | 0.011 |
| 9/11/14 | 0.011 |
| 9/12/14 | 0.011 |
| 9/15/14 | 0.011 |
| 9/16/14 | 0.011 |
| 9/17/14 | 0.01 |
| 9/18/14 | 0.011 |
| 9/19/14 | 0.011 |
| 9/22/14 | 0.011 |
| 9/23/14 | 0.012 |
| 9/24/14 | 0.012 |
| 9/25/14 | 0.012 |
| 9/26/14 | 0.012 |
| 9/29/14 | 0.012 |
| 9/30/14 | 0.012 |
| 10/1/14 | 0.013 |
| 10/2/14 | 0.013 |
| 10/3/14 | 0.012 |
| 10/6/14 | 0.012 |
| 10/7/14 | 0.013 |
| 10/8/14 | 0.012 |
| 10/9/14 | 0.013 |
| 10/10/14 | 0.013 |
| 10/14/14 | 0.014 |
| 10/15/14 | 0.015 |
| 10/16/14 | 0.015 |
| 10/17/14 | 0.014 |
| 10/20/14 | 0.014 |
| 10/21/14 | 0.013 |
| 10/22/14 | 0.013 |
| 10/23/14 | 0.012 |
| 10/24/14 | 0.012 |
| 10/27/14 | 0.012 |
| 10/28/14 | 0.012 |
| 10/29/14 | 0.012 |
| 10/30/14 | 0.011 |
| 10/31/14 | 0.011 |
| 11/3/14 | 0.011 |
| 11/4/14 | 0.011 |
| 11/5/14 | 0.01 |
| 11/6/14 | 0.01 |
| 11/7/14 | 0.011 |
| 11/10/14 | 0.01 |
| 11/12/14 | 0.011 |
| 11/13/14 | 0.011 |
| 11/14/14 | 0.012 |
| 11/17/14 | 0.011 |
| 11/18/14 | 0.011 |
| 11/19/14 | 0.011 |
| 11/20/14 | 0.011 |
| 11/21/14 | 0.011 |
| 11/24/14 | 0.012 |
| 11/25/14 | 0.012 |
| 11/26/14 | 0.012 |
| 11/28/14 | 0.012 |
| 12/1/14 | 0.012 |
| 12/2/14 | 0.011 |
| 12/3/14 | 0.011 |
| 12/4/14 | 0.012 |
| 12/5/14 | 0.011 |
| 12/8/14 | 0.012 |
| 12/9/14 | 0.012 |
| 12/10/14 | 0.013 |
| 12/11/14 | 0.012 |
| 12/12/14 | 0.013 |
| 12/15/14 | 0.014 |
| 12/16/14 | 0.014 |
| 12/17/14 | 0.013 |
| 12/18/14 | 0.011 |
| 12/19/14 | 0.012 |
| 12/22/14 | 0.012 |
| 12/23/14 | 0.011 |
| 12/24/14 | 0.01 |
| 12/26/14 | 0.01 |
| 12/29/14 | 0.01 |
| 12/30/14 | 0.011 |
| 12/31/14 | 0.012 |
| 1/2/15 | 0.012 |
| 1/5/15 | 0.013 |
| 1/6/15 | 0.014 |
| 1/7/15 | 0.013 |
| 1/8/15 | 0.013 |
| 1/9/15 | 0.013 |
| 1/12/15 | 0.014 |
| 1/13/15 | 0.014 |
| 1/14/15 | 0.014 |
| 1/15/15 | 0.015 |
| 1/16/15 | 0.014 |
| 1/20/15 | 0.014 |
| 1/21/15 | 0.013 |
| 1/22/15 | 0.013 |
| 1/23/15 | 0.014 |
| 1/26/15 | 0.014 |
| 1/27/15 | 0.014 |
| 1/28/15 | 0.015 |
| 1/29/15 | 0.014 |
| 1/30/15 | 0.016 |
| 2/2/15 | 0.016 |
| 2/3/15 | 0.014 |
| 2/4/15 | 0.015 |
| 2/5/15 | 0.014 |
| 2/6/15 | 0.014 |
| 2/9/15 | 0.015 |
| 2/10/15 | 0.013 |
| 2/11/15 | 0.014 |
| 2/12/15 | 0.015 |
| 2/13/15 | 0.015 |
| 2/17/15 | 0.014 |
| 2/18/15 | 0.014 |
| 2/19/15 | 0.014 |
| 2/20/15 | 0.013 |
| 2/23/15 | 0.014 |
| 2/24/15 | 0.014 |
| 2/25/15 | 0.015 |
| 2/26/15 | 0.015 |
| 2/27/15 | 0.015 |
| 3/2/15 | 0.015 |
| 3/3/15 | 0.014 |
| 3/4/15 | 0.015 |
| 3/5/15 | 0.015 |
| 3/6/15 | 0.014 |
| 3/9/15 | 0.015 |
| 3/10/15 | 0.015 |
| 3/11/15 | 0.016 |
| 3/12/15 | 0.015 |
| 3/13/15 | 0.015 |
| 3/16/15 | 0.015 |
| 3/17/15 | 0.016 |
| 3/18/15 | 0.016 |
| 3/19/15 | 0.016 |
| 3/20/15 | 0.016 |
| 3/23/15 | 0.016 |
| 3/24/15 | 0.017 |
| 3/25/15 | 0.017 |
| 3/26/15 | 0.016 |
| 3/27/15 | 0.017 |
| 3/30/15 | 0.016 |
| 3/31/15 | 0.016 |
| 4/1/15 | 0.017 |
| 4/2/15 | 0.016 |
| 4/6/15 | 0.016 |
| 4/7/15 | 0.017 |
| 4/8/15 | 0.016 |
| 4/9/15 | 0.016 |
| 4/10/15 | 0.016 |
| 4/13/15 | 0.017 |
| 4/14/15 | 0.017 |
| 4/15/15 | 0.017 |
| 4/16/15 | 0.017 |
| 4/17/15 | 0.017 |
| 4/20/15 | 0.016 |
| 4/21/15 | 0.017 |
| 4/22/15 | 0.016 |
| 4/23/15 | 0.016 |
| 4/24/15 | 0.016 |
| 4/27/15 | 0.016 |
| 4/28/15 | 0.015 |
| 4/29/15 | 0.015 |
| 4/30/15 | 0.016 |
| 5/1/15 | 0.015 |
| 5/4/15 | 0.014 |
| 5/5/15 | 0.015 |
| 5/6/15 | 0.014 |
| 5/7/15 | 0.015 |
| 5/8/15 | 0.015 |
| 5/11/15 | 0.014 |
| 5/12/15 | 0.014 |
| 5/13/15 | 0.014 |
| 5/14/15 | 0.014 |
| 5/15/15 | 0.015 |
| 5/18/15 | 0.014 |
| 5/19/15 | 0.013 |
| 5/20/15 | 0.013 |
| 5/21/15 | 0.014 |
| 5/22/15 | 0.014 |
| 5/26/15 | 0.015 |
| 5/27/15 | 0.015 |
| 5/28/15 | 0.015 |
| 5/29/15 | 0.015 |
| 6/1/15 | 0.014 |
| 6/2/15 | 0.014 |
| 6/3/15 | 0.014 |
| 6/4/15 | 0.014 |
| 6/5/15 | 0.014 |
| 6/8/15 | 0.014 |
| 6/9/15 | 0.014 |
| 6/10/15 | 0.013 |
| 6/11/15 | 0.014 |
| 6/12/15 | 0.014 |
| 6/15/15 | 0.015 |
| 6/16/15 | 0.015 |
| 6/17/15 | 0.014 |
| 6/18/15 | 0.014 |
| 6/19/15 | 0.015 |
| 6/22/15 | 0.014 |
| 6/23/15 | 0.014 |
| 6/24/15 | 0.015 |
| 6/25/15 | 0.015 |
| 6/26/15 | 0.014 |
| 6/29/15 | 0.016 |
| 6/30/15 | 0.015 |
| 7/1/15 | 0.014 |
| 7/2/15 | 0.015 |
| 7/6/15 | 0.016 |
| 7/7/15 | 0.015 |
| 7/8/15 | 0.016 |
| 7/9/15 | 0.015 |
| 7/10/15 | 0.014 |
| 7/13/15 | 0.014 |
| 7/14/15 | 0.014 |
| 7/15/15 | 0.014 |
| 7/16/15 | 0.014 |
| 7/17/15 | 0.014 |
| 7/20/15 | 0.014 |
| 7/21/15 | 0.015 |
| 7/22/15 | 0.015 |
| 7/23/15 | 0.016 |
| 7/24/15 | 0.016 |
| 7/27/15 | 0.016 |
| 7/28/15 | 0.015 |
| 7/29/15 | 0.015 |
| 7/30/15 | 0.015 |
| 7/31/15 | 0.015 |
| 8/3/15 | 0.015 |
| 8/4/15 | 0.015 |
| 8/5/15 | 0.015 |
| 8/6/15 | 0.015 |
| 8/7/15 | 0.015 |
| 8/10/15 | 0.015 |
| 8/11/15 | 0.015 |
| 8/12/15 | 0.015 |
| 8/13/15 | 0.014 |
| 8/14/15 | 0.014 |
| 8/17/15 | 0.014 |
| 8/18/15 | 0.014 |
| 8/19/15 | 0.015 |
| 8/20/15 | 0.015 |
| 8/21/15 | 0.016 |
| 8/24/15 | 0.018 |
| 8/25/15 | 0.018 |
| 8/26/15 | 0.017 |
| 8/27/15 | 0.016 |
| 8/28/15 | 0.016 |
| 8/31/15 | 0.017 |
| 9/1/15 | 0.018 |
| 9/2/15 | 0.018 |
| 9/3/15 | 0.018 |
| 9/4/15 | 0.019 |
| 9/8/15 | 0.017 |
| 9/9/15 | 0.018 |
| 9/10/15 | 0.018 |
| 9/11/15 | 0.018 |
| 9/14/15 | 0.018 |
| 9/15/15 | 0.017 |
| 9/16/15 | 0.016 |
| 9/17/15 | 0.017 |
| 9/18/15 | 0.018 |
| 9/21/15 | 0.017 |
| 9/22/15 | 0.018 |
| 9/23/15 | 0.018 |
| 9/24/15 | 0.018 |
| 9/25/15 | 0.017 |
| 9/28/15 | 0.018 |
| 9/29/15 | 0.018 |
| 9/30/15 | 0.017 |
| 10/1/15 | 0.018 |
| 10/2/15 | 0.018 |
| 10/5/15 | 0.017 |
| 10/6/15 | 0.017 |
| 10/7/15 | 0.017 |
| 10/8/15 | 0.016 |
| 10/9/15 | 0.016 |
| 10/12/15 | 0.016 |
| 10/13/15 | 0.017 |
| 10/14/15 | 0.017 |
| 10/15/15 | 0.016 |
| 10/16/15 | 0.016 |
| 10/19/15 | 0.016 |
| 10/20/15 | 0.016 |
| 10/21/15 | 0.016 |
| 10/22/15 | 0.016 |
| 10/23/15 | 0.016 |
| 10/26/15 | 0.016 |
| 10/27/15 | 0.017 |
| 10/28/15 | 0.016 |
| 10/29/15 | 0.016 |
| 10/30/15 | 0.016 |
| 11/2/15 | 0.015 |
| 11/3/15 | 0.015 |
| 11/4/15 | 0.015 |
| 11/5/15 | 0.015 |
| 11/6/15 | 0.016 |
| 11/9/15 | 0.015 |
| 11/10/15 | 0.016 |
| 11/11/15 | 0.015 |
| 11/12/15 | 0.016 |
| 11/13/15 | 0.016 |
| 11/16/15 | 0.016 |
| 11/17/15 | 0.017 |
| 11/18/15 | 0.016 |
| 11/19/15 | 0.016 |
| 11/20/15 | 0.016 |
| 11/23/15 | 0.016 |
| 11/24/15 | 0.016 |
| 11/25/15 | 0.017 |
| 11/27/15 | 0.017 |
| 11/30/15 | 0.017 |
| 12/1/15 | 0.017 |
| 12/2/15 | 0.018 |
| 12/3/15 | 0.016 |
| 12/4/15 | 0.016 |
| 12/7/15 | 0.017 |
| 12/8/15 | 0.017 |
| 12/9/15 | 0.017 |
| 12/10/15 | 0.018 |
| 12/11/15 | 0.019 |
| 12/14/15 | 0.018 |
| 12/15/15 | 0.017 |
| 12/16/15 | 0.016 |
| 12/17/15 | 0.016 |
| 12/18/15 | 0.017 |
| 12/21/15 | 0.017 |
| 12/22/15 | 0.016 |
| 12/23/15 | 0.015 |
| 12/24/15 | 0.016 |
| 12/28/15 | 0.016 |
| 12/29/15 | 0.015 |
| 12/30/15 | 0.015 |
| 12/31/15 | 0.016 |
| 1/4/16 | 0.016 |
| 1/5/16 | 0.016 |
| 1/6/16 | 0.016 |
| 1/7/16 | 0.017 |
| 1/8/16 | 0.017 |
| 1/11/16 | 0.017 |
| 1/12/16 | 0.017 |
| 1/13/16 | 0.018 |
| 1/14/16 | 0.017 |
| 1/15/16 | 0.018 |
| 1/19/16 | 0.017 |
| 1/20/16 | 0.018 |
| 1/21/16 | 0.018 |
| 1/22/16 | 0.017 |
| 1/25/16 | 0.018 |
| 1/26/16 | 0.018 |
| 1/27/16 | 0.018 |
| 1/28/16 | 0.017 |
| 1/29/16 | 0.017 |
| 2/1/16 | 0.017 |
| 2/2/16 | 0.017 |
| 2/3/16 | 0.017 |
| 2/4/16 | 0.017 |
| 2/5/16 | 0.017 |
| 2/8/16 | 0.018 |
| 2/9/16 | 0.018 |
| 2/10/16 | 0.019 |
| 2/11/16 | 0.02 |
| 2/12/16 | 0.019 |
| 2/16/16 | 0.019 |
| 2/17/16 | 0.018 |
| 2/18/16 | 0.019 |
| 2/19/16 | 0.019 |
| 2/22/16 | 0.018 |
| 2/23/16 | 0.018 |
| 2/24/16 | 0.018 |
| 2/25/16 | 0.018 |
| 2/26/16 | 0.019 |
| 2/29/16 | 0.019 |
| 3/1/16 | 0.018 |
| 3/2/16 | 0.018 |
| 3/3/16 | 0.018 |
| 3/4/16 | 0.017 |
| 3/7/16 | 0.016 |
| 3/8/16 | 0.017 |
| 3/9/16 | 0.016 |
| 3/10/16 | 0.016 |
| 3/11/16 | 0.015 |
| 3/14/16 | 0.015 |
| 3/15/16 | 0.015 |
| 3/16/16 | 0.015 |
| 3/17/16 | 0.015 |
| 3/18/16 | 0.015 |
| 3/21/16 | 0.015 |
| 3/22/16 | 0.015 |
| 3/23/16 | 0.015 |
| 3/24/16 | 0.015 |
| 3/28/16 | 0.015 |
| 3/29/16 | 0.016 |
| 3/30/16 | 0.015 |
| 3/31/16 | 0.016 |
| 4/1/16 | 0.016 |
| 4/4/16 | 0.016 |
| 4/5/16 | 0.017 |
| 4/6/16 | 0.017 |
| 4/7/16 | 0.017 |
| 4/8/16 | 0.017 |
| 4/11/16 | 0.017 |
| 4/12/16 | 0.016 |
| 4/13/16 | 0.016 |
| 4/14/16 | 0.016 |
| 4/15/16 | 0.016 |
| 4/18/16 | 0.016 |
| 4/19/16 | 0.016 |
| 4/20/16 | 0.016 |
| 4/21/16 | 0.017 |
| 4/22/16 | 0.016 |
| 4/25/16 | 0.016 |
| 4/26/16 | 0.016 |
| 4/27/16 | 0.016 |
| 4/28/16 | 0.016 |
| 4/29/16 | 0.016 |
| 5/2/16 | 0.015 |
| 5/3/16 | 0.016 |
| 5/4/16 | 0.016 |
| 5/5/16 | 0.016 |
| 5/6/16 | 0.016 |
| 5/9/16 | 0.016 |
| 5/10/16 | 0.016 |
| 5/11/16 | 0.017 |
| 5/12/16 | 0.016 |
| 5/13/16 | 0.017 |
| 5/16/16 | 0.016 |
| 5/17/16 | 0.017 |
| 5/18/16 | 0.016 |
| 5/19/16 | 0.016 |
| 5/20/16 | 0.016 |
| 5/23/16 | 0.017 |
| 5/24/16 | 0.016 |
| 5/25/16 | 0.016 |
| 5/26/16 | 0.016 |
| 5/27/16 | 0.016 |
| 5/31/16 | 0.016 |
| 6/1/16 | 0.016 |
| 6/2/16 | 0.016 |
| 6/3/16 | 0.017 |
| 6/6/16 | 0.016 |
| 6/7/16 | 0.017 |
| 6/8/16 | 0.016 |
| 6/9/16 | 0.017 |
| 6/10/16 | 0.017 |
| 6/13/16 | 0.017 |
| 6/14/16 | 0.017 |
| 6/15/16 | 0.018 |
| 6/16/16 | 0.018 |
| 6/17/16 | 0.017 |
| 6/20/16 | 0.017 |
| 6/21/16 | 0.016 |
| 6/22/16 | 0.017 |
| 6/23/16 | 0.016 |
| 6/24/16 | 0.018 |
| 6/27/16 | 0.018 |
| 6/28/16 | 0.018 |
| 6/29/16 | 0.018 |
| 6/30/16 | 0.017 |
| 7/1/16 | 0.017 |
| 7/5/16 | 0.018 |
| 7/6/16 | 0.018 |
| 7/7/16 | 0.018 |
| 7/8/16 | 0.018 |
| 7/11/16 | 0.018 |
| 7/12/16 | 0.017 |
| 7/13/16 | 0.018 |
| 7/14/16 | 0.017 |
| 7/15/16 | 0.016 |
| 7/18/16 | 0.016 |
| 7/19/16 | 0.017 |
| 7/20/16 | 0.017 |
| 7/21/16 | 0.017 |
| 7/22/16 | 0.016 |
| 7/25/16 | 0.016 |
| 7/26/16 | 0.017 |
| 7/27/16 | 0.017 |
| 7/28/16 | 0.017 |
| 7/29/16 | 0.018 |
| 8/1/16 | 0.017 |
| 8/2/16 | 0.017 |
| 8/3/16 | 0.017 |
| 8/4/16 | 0.018 |
| 8/5/16 | 0.017 |
| 8/8/16 | 0.017 |
| 8/9/16 | 0.018 |
| 8/10/16 | 0.019 |
| 8/11/16 | 0.018 |
| 8/12/16 | 0.018 |
| 8/15/16 | 0.019 |
| 8/16/16 | 0.019 |
| 8/17/16 | 0.018 |
| 8/18/16 | 0.018 |
| 8/19/16 | 0.018 |
| 8/22/16 | 0.018 |
| 8/23/16 | 0.019 |
| 8/24/16 | 0.018 |
| 8/25/16 | 0.018 |
| 8/26/16 | 0.019 |
| 8/29/16 | 0.019 |
| 8/30/16 | 0.019 |
| 8/31/16 | 0.019 |
| 9/1/16 | 0.019 |
| 9/2/16 | 0.019 |
| 9/6/16 | 0.019 |
| 9/7/16 | 0.019 |
| 9/8/16 | 0.018 |
| 9/9/16 | 0.019 |
| 9/12/16 | 0.018 |
| 9/13/16 | 0.018 |
| 9/14/16 | 0.018 |
| 9/15/16 | 0.018 |
| 9/16/16 | 0.018 |
| 9/19/16 | 0.017 |
| 9/20/16 | 0.017 |
| 9/21/16 | 0.017 |
| 9/22/16 | 0.017 |
| 9/23/16 | 0.017 |
| 9/26/16 | 0.018 |
| 9/27/16 | 0.018 |
| 9/28/16 | 0.018 |
| 9/29/16 | 0.019 |
| 9/30/16 | 0.019 |
| 10/3/16 | 0.019 |
| 10/4/16 | 0.019 |
| 10/5/16 | 0.019 |
| 10/6/16 | 0.019 |
| 10/7/16 | 0.019 |
| 10/10/16 | 0.019 |
| 10/11/16 | 0.019 |
| 10/12/16 | 0.018 |
| 10/13/16 | 0.018 |
| 10/14/16 | 0.018 |
| 10/17/16 | 0.018 |
| 10/18/16 | 0.018 |
| 10/19/16 | 0.018 |
| 10/20/16 | 0.018 |
| 10/21/16 | 0.018 |
| 10/24/16 | 0.018 |
| 10/25/16 | 0.018 |
| 10/26/16 | 0.017 |
| 10/27/16 | 0.017 |
| 10/28/16 | 0.017 |
| 10/31/16 | 0.016 |
| 11/1/16 | 0.017 |
| 11/2/16 | 0.018 |
| 11/3/16 | 0.017 |
| 11/4/16 | 0.018 |
| 11/7/16 | 0.017 |
| 11/8/16 | 0.016 |
| 11/9/16 | 0.016 |
| 11/10/16 | 0.016 |
| 11/11/16 | 0.016 |
| 11/14/16 | 0.015 |
| 11/15/16 | 0.014 |
| 11/16/16 | 0.015 |
| 11/17/16 | 0.014 |
| 11/18/16 | 0.014 |
| 11/21/16 | 0.014 |
| 11/22/16 | 0.014 |
| 11/23/16 | 0.014 |
| 11/25/16 | 0.013 |
| 11/28/16 | 0.013 |
| 11/29/16 | 0.013 |
| 11/30/16 | 0.013 |
| 12/1/16 | 0.013 |
| 12/2/16 | 0.013 |
| 12/5/16 | 0.013 |
| 12/6/16 | 0.013 |
| 12/7/16 | 0.013 |
| 12/8/16 | 0.013 |
| 12/9/16 | 0.012 |
| 12/12/16 | 0.011 |
| 12/13/16 | 0.011 |
| 12/14/16 | 0.011 |
| 12/15/16 | 0.01 |
| 12/16/16 | 0.01 |
| 12/19/16 | 0.01 |
| 12/20/16 | 0.01 |
| 12/21/16 | 0.01 |
| 12/22/16 | 0.01 |
| 12/23/16 | 0.01 |
| 12/27/16 | 0.01 |
| 12/28/16 | 0.011 |
| 12/29/16 | 0.011 |
| 12/30/16 | 0.011 |
| 1/3/17 | 0.011 |
| 1/4/17 | 0.011 |
| 1/5/17 | 0.012 |
| 1/6/17 | 0.011 |
| 1/9/17 | 0.012 |
| 1/10/17 | 0.012 |
| 1/11/17 | 0.012 |
| 1/12/17 | 0.012 |
| 1/13/17 | 0.012 |
| 1/17/17 | 0.012 |
| 1/18/17 | 0.011 |
| 1/19/17 | 0.011 |
| 1/20/17 | 0.011 |
| 1/23/17 | 0.012 |
| 1/24/17 | 0.011 |
| 1/25/17 | 0.01 |
| 1/26/17 | 0.011 |
| 1/27/17 | 0.011 |
| 1/30/17 | 0.011 |
| 1/31/17 | 0.011 |
| 2/1/17 | 0.011 |
| 2/2/17 | 0.011 |
| 2/3/17 | 0.01 |
| 2/6/17 | 0.011 |
| 2/7/17 | 0.011 |
| 2/8/17 | 0.012 |
| 2/9/17 | 0.011 |
| 2/10/17 | 0.011 |
| 2/13/17 | 0.011 |
| 2/14/17 | 0.011 |
| 2/15/17 | 0.01 |
| 2/16/17 | 0.011 |
| 2/17/17 | 0.011 |
| 2/21/17 | 0.01 |
| 2/22/17 | 0.011 |
| 2/23/17 | 0.011 |
| 2/24/17 | 0.011 |
| 2/27/17 | 0.01 |
| 2/28/17 | 0.01 |
| 3/1/17 | 0.01 |
| 3/2/17 | 0.009 |
| 3/3/17 | 0.009 |
| 3/6/17 | 0.009 |
| 3/7/17 | 0.009 |
| 3/8/17 | 0.009 |
| 3/9/17 | 0.009 |
| 3/10/17 | 0.009 |
| 3/13/17 | 0.008 |
| 3/14/17 | 0.008 |
| 3/15/17 | 0.009 |
| 3/16/17 | 0.009 |
| 3/17/17 | 0.009 |
| 3/20/17 | 0.01 |
| 3/21/17 | 0.01 |
| 3/22/17 | 0.01 |
| 3/23/17 | 0.01 |
| 3/24/17 | 0.01 |
| 3/27/17 | 0.01 |
| 3/28/17 | 0.01 |
| 3/29/17 | 0.01 |
| 3/30/17 | 0.01 |
| 3/31/17 | 0.01 |
| 4/3/17 | 0.011 |
| 4/4/17 | 0.011 |
| 4/5/17 | 0.011 |
| 4/6/17 | 0.011 |
| 4/7/17 | 0.01 |
| 4/10/17 | 0.01 |
| 4/11/17 | 0.011 |
| 4/12/17 | 0.011 |
| 4/13/17 | 0.012 |
| 4/17/17 | 0.011 |
| 4/18/17 | 0.012 |
| 4/19/17 | 0.012 |
| 4/20/17 | 0.012 |
| 4/21/17 | 0.012 |
| 4/24/17 | 0.011 |
| 4/25/17 | 0.01 |
| 4/26/17 | 0.011 |
| 4/27/17 | 0.011 |
| 4/28/17 | 0.011 |
| 5/1/17 | 0.011 |
| 5/2/17 | 0.011 |
| 5/3/17 | 0.011 |
| 5/4/17 | 0.011 |
| 5/5/17 | 0.01 |
| 5/8/17 | 0.01 |
| 5/9/17 | 0.01 |
| 5/10/17 | 0.01 |
| 5/11/17 | 0.01 |
| 5/12/17 | 0.011 |
| 5/15/17 | 0.011 |
| 5/16/17 | 0.011 |
| 5/17/17 | 0.012 |
| 5/18/17 | 0.012 |
| 5/19/17 | 0.012 |
| 5/22/17 | 0.011 |
| 5/23/17 | 0.011 |
| 5/24/17 | 0.011 |
| 5/25/17 | 0.011 |
| 5/26/17 | 0.011 |
| 5/30/17 | 0.011 |
| 5/31/17 | 0.011 |
| 6/1/17 | 0.011 |
| 6/2/17 | 0.011 |
| 6/5/17 | 0.011 |
| 6/6/17 | 0.012 |
| 6/7/17 | 0.011 |
| 6/8/17 | 0.011 |
| 6/9/17 | 0.011 |
| 6/12/17 | 0.011 |
| 6/13/17 | 0.011 |
| 6/14/17 | 0.012 |
| 6/15/17 | 0.011 |
| 6/16/17 | 0.011 |
| 6/19/17 | 0.011 |
| 6/20/17 | 0.011 |
| 6/21/17 | 0.012 |
| 6/22/17 | 0.012 |
| 6/23/17 | 0.012 |
| 6/26/17 | 0.012 |
| 6/27/17 | 0.012 |
| 6/28/17 | 0.012 |
| 6/29/17 | 0.012 |
| 6/30/17 | 0.011 |
| 7/3/17 | 0.011 |
| 7/5/17 | 0.011 |
| 7/6/17 | 0.011 |
| 7/7/17 | 0.011 |
| 7/10/17 | 0.011 |
| 7/11/17 | 0.011 |
| 7/12/17 | 0.011 |
| 7/13/17 | 0.011 |
| 7/14/17 | 0.011 |
| 7/17/17 | 0.011 |
| 7/18/17 | 0.011 |
| 7/19/17 | 0.011 |
| 7/20/17 | 0.011 |
| 7/21/17 | 0.011 |
| 7/24/17 | 0.011 |
| 7/25/17 | 0.011 |
| 7/26/17 | 0.011 |
| 7/27/17 | 0.01 |
| 7/28/17 | 0.011 |
| 7/31/17 | 0.011 |
| 8/1/17 | 0.011 |
| 8/2/17 | 0.01 |
| 8/3/17 | 0.011 |
| 8/4/17 | 0.01 |
| 8/7/17 | 0.01 |
| 8/8/17 | 0.01 |
| 8/9/17 | 0.011 |
| 8/10/17 | 0.011 |
| 8/11/17 | 0.012 |
| 8/14/17 | 0.011 |
| 8/15/17 | 0.01 |
| 8/16/17 | 0.011 |
| 8/17/17 | 0.011 |
| 8/18/17 | 0.011 |
| 8/21/17 | 0.011 |
| 8/22/17 | 0.011 |
| 8/23/17 | 0.011 |
| 8/24/17 | 0.011 |
| 8/25/17 | 0.011 |
| 8/28/17 | 0.011 |
| 8/29/17 | 0.011 |
| 8/30/17 | 0.012 |
| 8/31/17 | 0.012 |
| 9/1/17 | 0.011 |
| 9/5/17 | 0.012 |
| 9/6/17 | 0.012 |
| 9/7/17 | 0.012 |
| 9/8/17 | 0.012 |
| 9/11/17 | 0.011 |
| 9/12/17 | 0.011 |
| 9/13/17 | 0.011 |
| 9/14/17 | 0.011 |
| 9/15/17 | 0.011 |
| 9/18/17 | 0.011 |
| 9/19/17 | 0.011 |
| 9/20/17 | 0.011 |
| 9/21/17 | 0.011 |
| 9/22/17 | 0.011 |
| 9/25/17 | 0.012 |
| 9/26/17 | 0.011 |
| 9/27/17 | 0.011 |
| 9/28/17 | 0.011 |
| 9/29/17 | 0.011 |
| 10/2/17 | 0.011 |
| 10/3/17 | 0.011 |
| 10/4/17 | 0.011 |
| 10/5/17 | 0.01 |
| 10/6/17 | 0.01 |
| 10/9/17 | 0.01 |
| 10/10/17 | 0.01 |
| 10/11/17 | 0.01 |
| 10/12/17 | 0.01 |
| 10/13/17 | 0.011 |
| 10/16/17 | 0.011 |
| 10/17/17 | 0.01 |
| 10/18/17 | 0.01 |
| 10/19/17 | 0.01 |
| 10/20/17 | 0.009 |
| 10/23/17 | 0.009 |
| 10/24/17 | 0.009 |
| 10/25/17 | 0.009 |
| 10/26/17 | 0.008 |
| 10/27/17 | 0.009 |
| 10/30/17 | 0.009 |
| 10/31/17 | 0.009 |
| 11/1/17 | 0.009 |
| 11/2/17 | 0.01 |
| 11/3/17 | 0.01 |
| 11/6/17 | 0.01 |
| 11/7/17 | 0.009 |
| 11/8/17 | 0.009 |
| 11/9/17 | 0.009 |
| 11/10/17 | 0.009 |
| 11/13/17 | 0.008 |
| 11/14/17 | 0.008 |
| 11/15/17 | 0.009 |
| 11/16/17 | 0.009 |
| 11/17/17 | 0.009 |
| 11/20/17 | 0.009 |
| 11/21/17 | 0.009 |
| 11/22/17 | 0.01 |
| 11/24/17 | 0.009 |
| 11/27/17 | 0.01 |
| 11/28/17 | 0.009 |
| 11/29/17 | 0.009 |
| 11/30/17 | 0.008 |
| 12/1/17 | 0.009 |
| 12/4/17 | 0.009 |
| 12/5/17 | 0.01 |
| 12/6/17 | 0.01 |
| 12/7/17 | 0.009 |
| 12/8/17 | 0.009 |
| 12/11/17 | 0.009 |
| 12/12/17 | 0.009 |
| 12/13/17 | 0.01 |
| 12/14/17 | 0.01 |
| 12/15/17 | 0.01 |
| 12/18/17 | 0.01 |
| 12/19/17 | 0.01 |
| 12/20/17 | 0.01 |
| 12/21/17 | 0.01 |
| 12/22/17 | 0.01 |
| 12/26/17 | 0.01 |
| 12/27/17 | 0.011 |
| 12/28/17 | 0.01 |
| 12/29/17 | 0.011 |
| 1/2/18 | 0.01 |
| 1/3/18 | 0.011 |
| 1/4/18 | 0.011 |
| 1/5/18 | 0.011 |
| 1/8/18 | 0.01 |
| 1/9/18 | 0.01 |
| 1/10/18 | 0.01 |
| 1/11/18 | 0.011 |
| 1/12/18 | 0.011 |
| 1/16/18 | 0.011 |
| 1/17/18 | 0.01 |
| 1/18/18 | 0.01 |
| 1/19/18 | 0.01 |
| 1/22/18 | 0.01 |
| 1/23/18 | 0.01 |
| 1/24/18 | 0.01 |
| 1/25/18 | 0.009 |
| 1/26/18 | 0.009 |
| 1/29/18 | 0.009 |
| 1/30/18 | 0.009 |
| 1/31/18 | 0.008 |
| 2/1/18 | 0.008 |
| 2/2/18 | 0.008 |
| 2/5/18 | 0.009 |
| 2/6/18 | 0.01 |
| 2/7/18 | 0.009 |
| 2/8/18 | 0.01 |
| 2/9/18 | 0.009 |
| 2/12/18 | 0.009 |
| 2/13/18 | 0.009 |
| 2/14/18 | 0.008 |
| 2/15/18 | 0.008 |
| 2/16/18 | 0.008 |
| 2/20/18 | 0.008 |
| 2/21/18 | 0.008 |
| 2/22/18 | 0.008 |
| 2/23/18 | 0.008 |
| 2/26/18 | 0.008 |
| 2/27/18 | 0.008 |
| 2/28/18 | 0.009 |
| 3/1/18 | 0.009 |
| 3/2/18 | 0.009 |
| 3/5/18 | 0.008 |
| 3/6/18 | 0.009 |
| 3/7/18 | 0.009 |
| 3/8/18 | 0.009 |
| 3/9/18 | 0.008 |
| 3/12/18 | 0.009 |
| 3/13/18 | 0.009 |
| 3/14/18 | 0.009 |
| 3/15/18 | 0.009 |
| 3/16/18 | 0.008 |
| 3/19/18 | 0.008 |
| 3/20/18 | 0.008 |
| 3/21/18 | 0.008 |
| 3/22/18 | 0.009 |
| 3/23/18 | 0.009 |
| 3/26/18 | 0.009 |
| 3/27/18 | 0.009 |
| 3/28/18 | 0.009 |
| 3/29/18 | 0.009 |
| 4/2/18 | 0.009 |
| 4/3/18 | 0.009 |
| 4/4/18 | 0.009 |
| 4/5/18 | 0.008 |
| 4/6/18 | 0.009 |
| 4/9/18 | 0.009 |
| 4/10/18 | 0.009 |
| 4/11/18 | 0.009 |
| 4/12/18 | 0.009 |
| 4/13/18 | 0.009 |
| 4/16/18 | 0.008 |
| 4/17/18 | 0.008 |
| 4/18/18 | 0.008 |
| 4/19/18 | 0.007 |
| 4/20/18 | 0.007 |
| 4/23/18 | 0.007 |
| 4/24/18 | 0.006 |
| 4/25/18 | 0.006 |
| 4/26/18 | 0.006 |
| 4/27/18 | 0.006 |
| 4/30/18 | 0.006 |
| 5/1/18 | 0.006 |
| 5/2/18 | 0.006 |
| 5/3/18 | 0.006 |
| 5/4/18 | 0.006 |
| 5/7/18 | 0.006 |
| 5/8/18 | 0.007 |
| 5/9/18 | 0.007 |
| 5/10/18 | 0.007 |
| 5/11/18 | 0.007 |
| 5/14/18 | 0.007 |
| 5/15/18 | 0.006 |
| 5/16/18 | 0.006 |
| 5/17/18 | 0.006 |
| 5/18/18 | 0.007 |
| 5/21/18 | 0.007 |
| 5/22/18 | 0.007 |
| 5/23/18 | 0.007 |
| 5/24/18 | 0.007 |
| 5/25/18 | 0.007 |
| 5/29/18 | 0.009 |
| 5/30/18 | 0.008 |
| 5/31/18 | 0.008 |
| 6/1/18 | 0.008 |
| 6/4/18 | 0.008 |
| 6/5/18 | 0.008 |
| 6/6/18 | 0.008 |
| 6/7/18 | 0.009 |
| 6/8/18 | 0.009 |
| 6/11/18 | 0.009 |
| 6/12/18 | 0.008 |
| 6/13/18 | 0.008 |
| 6/14/18 | 0.008 |
| 6/15/18 | 0.008 |
| 6/18/18 | 0.008 |
| 6/19/18 | 0.008 |
| 6/20/18 | 0.007 |
| 6/21/18 | 0.008 |
| 6/22/18 | 0.007 |
| 6/25/18 | 0.007 |
| 6/26/18 | 0.007 |
| 6/27/18 | 0.007 |
| 6/28/18 | 0.007 |
| 6/29/18 | 0.007 |
| 7/2/18 | 0.007 |
| 7/3/18 | 0.007 |
| 7/5/18 | 0.007 |
| 7/6/18 | 0.007 |
| 7/9/18 | 0.007 |
| 7/10/18 | 0.007 |
| 7/11/18 | 0.007 |
| 7/12/18 | 0.007 |
| 7/13/18 | 0.007 |
| 7/16/18 | 0.007 |
| 7/17/18 | 0.006 |
| 7/18/18 | 0.006 |
| 7/19/18 | 0.007 |
| 7/20/18 | 0.006 |
| 7/23/18 | 0.006 |
| 7/24/18 | 0.006 |
| 7/25/18 | 0.006 |
| 7/26/18 | 0.005 |
| 7/27/18 | 0.005 |
| 7/30/18 | 0.005 |
| 7/31/18 | 0.005 |
| 8/1/18 | 0.005 |
| 8/2/18 | 0.005 |
| 8/3/18 | 0.005 |
| 8/6/18 | 0.005 |
| 8/7/18 | 0.004 |
| 8/8/18 | 0.005 |
| 8/9/18 | 0.005 |
| 8/10/18 | 0.006 |
| 8/13/18 | 0.006 |
| 8/14/18 | 0.005 |
| 8/15/18 | 0.005 |
| 8/16/18 | 0.005 |
| 8/17/18 | 0.005 |
| 8/20/18 | 0.006 |
| 8/21/18 | 0.006 |
| 8/22/18 | 0.006 |
| 8/23/18 | 0.006 |
| 8/24/18 | 0.006 |
| 8/27/18 | 0.006 |
| 8/28/18 | 0.006 |
| 8/29/18 | 0.005 |
| 8/30/18 | 0.006 |
| 8/31/18 | 0.006 |
| 9/4/18 | 0.005 |
| 9/5/18 | 0.005 |
| 9/6/18 | 0.005 |
| 9/7/18 | 0.005 |
| 9/10/18 | 0.005 |
| 9/11/18 | 0.004 |
| 9/12/18 | 0.004 |
| 9/13/18 | 0.004 |
| 9/14/18 | 0.004 |
| 9/17/18 | 0.004 |
| 9/18/18 | 0.004 |
| 9/19/18 | 0.004 |
| 9/20/18 | 0.004 |
| 9/21/18 | 0.004 |
| 9/24/18 | 0.004 |
| 9/25/18 | 0.004 |
| 9/26/18 | 0.005 |
| 9/27/18 | 0.005 |
| 9/28/18 | 0.004 |
| 10/1/18 | 0.004 |
| 10/2/18 | 0.004 |
| 10/3/18 | 0.004 |
| 10/4/18 | 0.003 |
| 10/5/18 | 0.002 |
| 10/8/18 | 0.002 |
| 10/9/18 | 0.002 |
| 10/10/18 | 0.002 |
| 10/11/18 | 0.003 |
| 10/12/18 | 0.003 |
| 10/15/18 | 0.003 |
| 10/16/18 | 0.003 |
| 10/17/18 | 0.002 |
| 10/18/18 | 0.003 |
| 10/19/18 | 0.002 |
| 10/22/18 | 0.002 |
| 10/23/18 | 0.002 |
| 10/24/18 | 0.002 |
| 10/25/18 | 0.002 |
| 10/26/18 | 0.004 |
| 10/29/18 | 0.003 |
| 10/30/18 | 0.003 |
| 10/31/18 | 0.003 |
| 11/1/18 | 0.003 |
| 11/2/18 | 0.003 |
| 11/5/18 | 0.002 |
| 11/6/18 | 0.001 |
| 11/7/18 | 0.001 |
| 11/8/18 | 0.001 |
| 11/9/18 | 0.001 |
| 11/12/18 | 0.001 |
| 11/13/18 | 0.002 |
| 11/14/18 | 0.002 |
| 11/15/18 | 0.003 |
| 11/16/18 | 0.003 |
| 11/19/18 | 0.003 |
| 11/20/18 | 0.003 |
| 11/21/18 | 0.003 |
| 11/23/18 | 0.004 |
| 11/26/18 | 0.003 |
| 11/27/18 | 0.003 |
| 11/28/18 | 0.003 |
| 11/29/18 | 0.003 |
| 11/30/18 | 0.003 |
| 12/3/18 | 0.003 |
| 12/4/18 | 0.004 |
| 12/6/18 | 0.004 |
| 12/7/18 | 0.004 |
| 12/10/18 | 0.004 |
| 12/11/18 | 0.004 |
| 12/12/18 | 0.004 |
| 12/13/18 | 0.003 |
| 12/14/18 | 0.004 |
| 12/17/18 | 0.005 |
| 12/18/18 | 0.006 |
| 12/19/18 | 0.006 |
| 12/20/18 | 0.006 |
| 12/21/18 | 0.006 |
| 12/24/18 | 0.008 |
| 12/26/18 | 0.007 |
| 12/27/18 | 0.007 |
| 12/28/18 | 0.008 |
| 12/31/18 | 0.008 |
| 1/2/19 | 0.009 |
| 1/3/19 | 0.01 |
| 1/4/19 | 0.009 |
| 1/7/19 | 0.008 |
| 1/8/19 | 0.008 |
| 1/9/19 | 0.008 |
| 1/10/19 | 0.007 |
| 1/11/19 | 0.008 |
| 1/14/19 | 0.009 |
| 1/15/19 | 0.008 |
| 1/16/19 | 0.008 |
| 1/17/19 | 0.008 |
| 1/18/19 | 0.007 |
| 1/22/19 | 0.008 |
| 1/23/19 | 0.007 |
| 1/24/19 | 0.007 |
| 1/25/19 | 0.007 |
| 1/28/19 | 0.008 |
| 1/29/19 | 0.008 |
| 1/30/19 | 0.008 |
| 1/31/19 | 0.008 |
| 2/1/19 | 0.007 |
| 2/4/19 | 0.007 |
| 2/5/19 | 0.007 |
| 2/6/19 | 0.007 |
| 2/7/19 | 0.007 |
| 2/8/19 | 0.007 |
| 2/11/19 | 0.007 |
| 2/12/19 | 0.007 |
| 2/13/19 | 0.007 |
| 2/14/19 | 0.007 |
| 2/15/19 | 0.007 |
| 2/19/19 | 0.007 |
| 2/20/19 | 0.007 |
| 2/21/19 | 0.006 |
| 2/22/19 | 0.006 |
| 2/25/19 | 0.006 |
| 2/26/19 | 0.007 |
| 2/27/19 | 0.006 |
| 2/28/19 | 0.006 |
| 3/1/19 | 0.005 |
| 3/4/19 | 0.006 |
| 3/5/19 | 0.006 |
| 3/6/19 | 0.006 |
| 3/7/19 | 0.007 |
| 3/8/19 | 0.007 |
| 3/11/19 | 0.006 |
| 3/12/19 | 0.006 |
| 3/13/19 | 0.006 |
| 3/14/19 | 0.006 |
| 3/15/19 | 0.006 |
| 3/18/19 | 0.006 |
| 3/19/19 | 0.007 |
| 3/20/19 | 0.007 |
| 3/21/19 | 0.007 |
| 3/22/19 | 0.008 |
| 3/25/19 | 0.008 |
| 3/26/19 | 0.008 |
| 3/27/19 | 0.008 |
| 3/28/19 | 0.009 |
| 3/29/19 | 0.008 |
| 4/1/19 | 0.008 |
| 4/2/19 | 0.008 |
| 4/3/19 | 0.008 |
| 4/4/19 | 0.008 |
| 4/5/19 | 0.008 |
| 4/8/19 | 0.008 |
| 4/9/19 | 0.008 |
| 4/10/19 | 0.008 |
| 4/11/19 | 0.008 |
| 4/12/19 | 0.007 |
| 4/15/19 | 0.007 |
| 4/16/19 | 0.007 |
| 4/17/19 | 0.007 |
| 4/18/19 | 0.007 |
| 4/22/19 | 0.007 |
| 4/23/19 | 0.007 |
| 4/24/19 | 0.007 |
| 4/25/19 | 0.007 |
| 4/26/19 | 0.007 |
| 4/29/19 | 0.007 |
| 4/30/19 | 0.007 |
| 5/1/19 | 0.007 |
| 5/2/19 | 0.007 |
| 5/3/19 | 0.007 |
| 5/6/19 | 0.008 |
| 5/7/19 | 0.008 |
| 5/8/19 | 0.008 |
| 5/9/19 | 0.009 |
| 5/10/19 | 0.008 |
| 5/13/19 | 0.008 |
| 5/14/19 | 0.008 |
| 5/15/19 | 0.009 |
| 5/16/19 | 0.009 |
| 5/17/19 | 0.009 |
| 5/20/19 | 0.008 |
| 5/21/19 | 0.008 |
| 5/22/19 | 0.008 |
| 5/23/19 | 0.009 |
| 5/24/19 | 0.009 |
| 5/28/19 | 0.01 |
| 5/29/19 | 0.01 |
| 5/30/19 | 0.011 |
| 5/31/19 | 0.011 |
| 6/3/19 | 0.012 |
| 6/4/19 | 0.011 |
| 6/5/19 | 0.011 |
| 6/6/19 | 0.011 |
| 6/7/19 | 0.011 |
| 6/10/19 | 0.011 |
| 6/11/19 | 0.011 |
| 6/12/19 | 0.011 |
| 6/13/19 | 0.011 |
| 6/14/19 | 0.011 |
| 6/17/19 | 0.011 |
| 6/18/19 | 0.011 |
| 6/19/19 | 0.011 |
| 6/20/19 | 0.011 |
| 6/21/19 | 0.011 |
| 6/24/19 | 0.011 |
| 6/25/19 | 0.012 |
| 6/26/19 | 0.012 |
| 6/27/19 | 0.012 |
| 6/28/19 | 0.012 |
| 7/1/19 | 0.012 |
| 7/2/19 | 0.012 |
| 7/3/19 | 0.012 |
| 7/5/19 | 0.011 |
| 7/8/19 | 0.011 |
| 7/9/19 | 0.011 |
| 7/10/19 | 0.011 |
| 7/11/19 | 0.01 |
| 7/12/19 | 0.01 |
| 7/15/19 | 0.011 |
| 7/16/19 | 0.01 |
| 7/17/19 | 0.011 |
| 7/18/19 | 0.011 |
| 7/19/19 | 0.011 |
| 7/22/19 | 0.011 |
| 7/23/19 | 0.011 |
| 7/24/19 | 0.012 |
| 7/25/19 | 0.011 |
| 7/26/19 | 0.011 |
| 7/29/19 | 0.011 |
| 7/30/19 | 0.011 |
| 7/31/19 | 0.012 |
| 8/1/19 | 0.013 |
| 8/2/19 | 0.013 |
| 8/5/19 | 0.015 |
| 8/6/19 | 0.015 |
| 8/7/19 | 0.015 |
| 8/8/19 | 0.014 |
| 8/9/19 | 0.014 |
| 8/12/19 | 0.015 |
| 8/13/19 | 0.015 |
| 8/14/19 | 0.016 |
| 8/15/19 | 0.016 |
| 8/16/19 | 0.016 |
| 8/19/19 | 0.015 |
| 8/20/19 | 0.016 |
| 8/21/19 | 0.015 |
| 8/22/19 | 0.015 |
| 8/23/19 | 0.016 |
| 8/26/19 | 0.016 |
| 8/27/19 | 0.016 |
| 8/28/19 | 0.017 |
| 8/29/19 | 0.016 |
| 8/30/19 | 0.016 |
| 9/3/19 | 0.016 |
| 9/4/19 | 0.016 |
| 9/5/19 | 0.015 |
| 9/6/19 | 0.016 |
| 9/9/19 | 0.015 |
| 9/10/19 | 0.014 |
| 9/11/19 | 0.013 |
| 9/12/19 | 0.013 |
| 9/13/19 | 0.012 |
| 9/16/19 | 0.013 |
| 9/17/19 | 0.013 |
| 9/18/19 | 0.013 |
| 9/19/19 | 0.013 |
| 9/20/19 | 0.013 |
| 9/23/19 | 0.013 |
| 9/24/19 | 0.014 |
| 9/25/19 | 0.013 |
| 9/26/19 | 0.013 |
| 9/27/19 | 0.013 |
| 9/30/19 | 0.013 |
| 10/1/19 | 0.014 |
| 10/2/19 | 0.015 |
| 10/3/19 | 0.015 |
| 10/4/19 | 0.015 |
| 10/7/19 | 0.014 |
| 10/8/19 | 0.015 |
| 10/9/19 | 0.014 |
| 10/10/19 | 0.014 |
| 10/11/19 | 0.013 |
| 10/14/19 | 0.013 |
| 10/15/19 | 0.013 |
| 10/16/19 | 0.013 |
| 10/17/19 | 0.013 |
| 10/18/19 | 0.013 |
| 10/21/19 | 0.012 |
| 10/22/19 | 0.012 |
| 10/23/19 | 0.012 |
| 10/24/19 | 0.012 |
| 10/25/19 | 0.012 |
| 10/28/19 | 0.012 |
| 10/29/19 | 0.012 |
| 10/30/19 | 0.013 |
| 10/31/19 | 0.013 |
| 11/1/19 | 0.013 |
| 11/4/19 | 0.013 |
| 11/5/19 | 0.012 |
| 11/6/19 | 0.013 |
| 11/7/19 | 0.012 |
| 11/8/19 | 0.012 |
| 11/11/19 | 0.012 |
| 11/12/19 | 0.013 |
| 11/13/19 | 0.013 |
| 11/14/19 | 0.013 |
| 11/15/19 | 0.013 |
| 11/18/19 | 0.013 |
| 11/19/19 | 0.013 |
| 11/20/19 | 0.014 |
| 11/21/19 | 0.014 |
| 11/22/19 | 0.014 |
| 11/25/19 | 0.014 |
| 11/26/19 | 0.014 |
| 11/27/19 | 0.014 |
| 11/29/19 | 0.014 |
| 12/2/19 | 0.013 |
| 12/3/19 | 0.014 |
| 12/4/19 | 0.013 |
| 12/5/19 | 0.013 |
| 12/6/19 | 0.013 |
| 12/9/19 | 0.013 |
| 12/10/19 | 0.013 |
| 12/11/19 | 0.014 |
| 12/12/19 | 0.012 |
| 12/13/19 | 0.013 |
| 12/16/19 | 0.012 |
| 12/17/19 | 0.012 |
| 12/18/19 | 0.012 |
| 12/19/19 | 0.012 |
| 12/20/19 | 0.011 |
| 12/23/19 | 0.012 |
| 12/24/19 | 0.012 |
| 12/26/19 | 0.012 |
| 12/27/19 | 0.012 |
| 12/30/19 | 0.012 |
| 12/31/19 | 0.011 |
| 1/2/20 | 0.012 |
| 1/3/20 | 0.013 |
| 1/6/20 | 0.013 |
| 1/7/20 | 0.013 |
| 1/8/20 | 0.012 |
| 1/9/20 | 0.012 |
| 1/10/20 | 0.012 |
| 1/13/20 | 0.012 |
| 1/14/20 | 0.012 |
| 1/15/20 | 0.012 |
| 1/16/20 | 0.012 |
| 1/17/20 | 0.011 |
| 1/21/20 | 0.012 |
| 1/22/20 | 0.012 |
| 1/23/20 | 0.012 |
| 1/24/20 | 0.012 |
| 1/27/20 | 0.013 |
| 1/28/20 | 0.012 |
| 1/29/20 | 0.013 |
| 1/30/20 | 0.013 |
| 1/31/20 | 0.014 |
| 2/3/20 | 0.013 |
| 2/4/20 | 0.013 |
| 2/5/20 | 0.012 |
| 2/6/20 | 0.012 |
| 2/7/20 | 0.013 |
| 2/10/20 | 0.013 |
| 2/11/20 | 0.013 |
| 2/12/20 | 0.012 |
| 2/13/20 | 0.012 |
| 2/14/20 | 0.012 |
| 2/18/20 | 0.013 |
| 2/19/20 | 0.013 |
| 2/20/20 | 0.013 |
| 2/21/20 | 0.014 |
| 2/24/20 | 0.015 |
| 2/25/20 | 0.016 |
| 2/26/20 | 0.016 |
| 2/27/20 | 0.018 |
| 2/28/20 | 0.021 |
| 3/2/20 | 0.019 |
| 3/3/20 | 0.021 |
| 3/4/20 | 0.019 |
| 3/5/20 | 0.02 |
| 3/6/20 | 0.023 |
| 3/9/20 | 0.026 |
| 3/10/20 | 0.024 |
| 3/11/20 | 0.025 |
| 3/12/20 | 0.028 |
| 3/13/20 | 0.026 |
| 3/16/20 | 0.032 |
| 3/17/20 | 0.025 |
| 3/18/20 | 0.025 |
| 3/19/20 | 0.028 |
| 3/20/20 | 0.033 |
| 3/23/20 | 0.037 |
| 3/24/20 | 0.032 |
| 3/25/20 | 0.03 |
| 3/26/20 | 0.028 |
| 3/27/20 | 0.029 |
| 3/30/20 | 0.028 |
| 3/31/20 | 0.029 |
| 4/1/20 | 0.032 |
| 4/2/20 | 0.031 |
| 4/3/20 | 0.032 |
| 4/6/20 | 0.029 |
| 4/7/20 | 0.029 |
| 4/8/20 | 0.027 |
| 4/9/20 | 0.026 |
| 4/13/20 | 0.026 |
| 4/14/20 | 0.025 |
| 4/15/20 | 0.028 |
| 4/16/20 | 0.028 |
| 4/17/20 | 0.027 |
| 4/20/20 | 0.028 |
| 4/21/20 | 0.029 |
| 4/22/20 | 0.028 |
| 4/23/20 | 0.028 |
| 4/24/20 | 0.028 |
| 4/27/20 | 0.027 |
| 4/28/20 | 0.028 |
| 4/29/20 | 0.028 |
| 4/30/20 | 0.029 |
| 5/1/20 | 0.03 |
| 5/4/20 | 0.029 |
| 5/5/20 | 0.029 |
| 5/6/20 | 0.03 |
| 5/7/20 | 0.03 |
| 5/8/20 | 0.029 |
| 5/11/20 | 0.029 |
| 5/12/20 | 0.029 |
| 5/13/20 | 0.03 |
| 5/14/20 | 0.03 |
| 5/15/20 | 0.031 |
| 5/18/20 | 0.028 |
| 5/19/20 | 0.029 |
| 5/20/20 | 0.029 |
| 5/21/20 | 0.029 |
| 5/22/20 | 0.029 |
| 5/26/20 | 0.029 |
| 5/27/20 | 0.028 |
| 5/28/20 | 0.027 |
| 5/29/20 | 0.027 |
| 6/1/20 | 0.027 |
| 6/2/20 | 0.027 |
| 6/3/20 | 0.025 |
| 6/4/20 | 0.025 |
| 6/5/20 | 0.024 |
| 6/8/20 | 0.024 |
| 6/9/20 | 0.025 |
| 6/10/20 | 0.026 |
| 6/11/20 | 0.028 |
| 6/12/20 | 0.028 |
| 6/15/20 | 0.027 |
| 6/16/20 | 0.027 |
| 6/17/20 | 0.027 |
| 6/18/20 | 0.027 |
| 6/19/20 | 0.029 |
| 6/22/20 | 0.028 |
| 6/23/20 | 0.028 |
| 6/24/20 | 0.029 |
| 6/25/20 | 0.03 |
| 6/26/20 | 0.03 |
| 6/29/20 | 0.03 |
| 6/30/20 | 0.029 |
| 7/1/20 | 0.028 |
| 7/2/20 | 0.028 |
| 7/6/20 | 0.029 |
| 7/7/20 | 0.029 |
| 7/8/20 | 0.029 |
| 7/9/20 | 0.029 |
| 7/10/20 | 0.029 |
| 7/13/20 | 0.029 |
| 7/14/20 | 0.028 |
| 7/15/20 | 0.028 |
| 7/16/20 | 0.028 |
| 7/17/20 | 0.027 |
| 7/20/20 | 0.028 |
| 7/21/20 | 0.028 |
| 7/22/20 | 0.027 |
| 7/23/20 | 0.028 |
| 7/24/20 | 0.028 |
| 7/27/20 | 0.028 |
| 7/28/20 | 0.028 |
| 7/29/20 | 0.028 |
| 7/30/20 | 0.028 |
| 7/31/20 | 0.028 |
| 8/3/20 | 0.028 |
| 8/4/20 | 0.028 |
| 8/5/20 | 0.028 |
| 8/6/20 | 0.028 |
| 8/7/20 | 0.027 |
| 8/10/20 | 0.027 |
| 8/11/20 | 0.028 |
| 8/12/20 | 0.026 |
| 8/13/20 | 0.026 |
| 8/14/20 | 0.027 |
| 8/17/20 | 0.027 |
| 8/18/20 | 0.028 |
| 8/19/20 | 0.027 |
| 8/20/20 | 0.028 |
| 8/21/20 | 0.028 |
| 8/24/20 | 0.028 |
| 8/25/20 | 0.028 |
| 8/26/20 | 0.028 |
| 8/27/20 | 0.028 |
| 8/28/20 | 0.027 |
| 8/31/20 | 0.028 |
| 9/1/20 | 0.028 |
| 9/2/20 | 0.027 |
| 9/3/20 | 0.028 |
| 9/4/20 | 0.027 |
| 9/8/20 | 0.028 |
| 9/9/20 | 0.027 |
| 9/10/20 | 0.028 |
| 9/11/20 | 0.028 |
| 9/14/20 | 0.028 |
| 9/15/20 | 0.028 |
| 9/16/20 | 0.027 |
| 9/17/20 | 0.028 |
| 9/18/20 | 0.028 |
| 9/21/20 | 0.029 |
| 9/22/20 | 0.028 |
| 9/23/20 | 0.029 |
| 9/24/20 | 0.029 |
| 9/25/20 | 0.028 |
| 9/28/20 | 0.028 |
| 9/29/20 | 0.028 |
| 9/30/20 | 0.028 |
| 10/1/20 | 0.029 |
| 10/2/20 | 0.028 |
| 10/5/20 | 0.027 |
| 10/6/20 | 0.027 |
| 10/7/20 | 0.026 |
| 10/8/20 | 0.026 |
| 10/9/20 | 0.026 |
| 10/12/20 | 0.026 |
| 10/13/20 | 0.026 |
| 10/14/20 | 0.027 |
| 10/15/20 | 0.026 |
| 10/16/20 | 0.026 |
| 10/19/20 | 0.026 |
| 10/20/20 | 0.026 |
| 10/21/20 | 0.025 |
| 10/22/20 | 0.025 |
| 10/23/20 | 0.025 |
| 10/26/20 | 0.025 |
| 10/27/20 | 0.025 |
| 10/28/20 | 0.026 |
| 10/29/20 | 0.026 |
| 10/30/20 | 0.026 |
| 11/2/20 | 0.025 |
| 11/3/20 | 0.024 |
| 11/4/20 | 0.026 |
| 11/5/20 | 0.026 |
| 11/6/20 | 0.025 |
| 11/9/20 | 0.024 |
| 11/10/20 | 0.023 |
| 11/11/20 | 0.023 |
| 11/12/20 | 0.024 |
| 11/13/20 | 0.024 |
| 11/16/20 | 0.023 |
| 11/17/20 | 0.024 |
| 11/18/20 | 0.025 |
| 11/19/20 | 0.026 |
| 11/20/20 | 0.026 |
| 11/23/20 | 0.026 |
| 11/24/20 | 0.025 |
| 11/25/20 | 0.025 |
| 11/27/20 | 0.026 |
| 11/30/20 | 0.026 |
| 12/1/20 | 0.025 |
| 12/2/20 | 0.025 |
| 12/3/20 | 0.025 |
| 12/4/20 | 0.025 |
| 12/7/20 | 0.025 |
| 12/8/20 | 0.025 |
| 12/9/20 | 0.025 |
| 12/10/20 | 0.026 |
| 12/11/20 | 0.026 |
| 12/14/20 | 0.026 |
| 12/15/20 | 0.025 |
| 12/16/20 | 0.026 |
| 12/17/20 | 0.025 |
| 12/18/20 | 0.025 |
| 12/21/20 | 0.026 |
| 12/22/20 | 0.026 |
| 12/23/20 | 0.026 |
| 12/24/20 | 0.026 |
| 12/28/20 | 0.026 |
| 12/29/20 | 0.026 |
| 12/30/20 | 0.025 |
| 12/31/20 | 0.025 |
| 1/4/21 | 0.024 |
| 1/5/21 | 0.024 |
| 1/6/21 | 0.022 |
| 1/7/21 | 0.022 |
| 1/8/21 | 0.022 |
| 1/11/21 | 0.022 |
| 1/12/21 | 0.022 |
| 1/13/21 | 0.022 |
| 1/14/21 | 0.021 |
| 1/15/21 | 0.022 |
| 1/19/21 | 0.022 |
| 1/20/21 | 0.022 |
| 1/21/21 | 0.022 |
| 1/22/21 | 0.022 |
| 1/25/21 | 0.022 |
| 1/26/21 | 0.022 |
| 1/27/21 | 0.023 |
| 1/28/21 | 0.022 |
| 1/29/21 | 0.022 |
| 2/1/21 | 0.022 |
| 2/2/21 | 0.021 |
| 2/3/21 | 0.021 |
| 2/4/21 | 0.021 |
| 2/5/21 | 0.02 |
| 2/8/21 | 0.021 |
| 2/9/21 | 0.021 |
| 2/10/21 | 0.021 |
| 2/11/21 | 0.021 |
| 2/12/21 | 0.021 |
| 2/16/21 | 0.02 |
| 2/17/21 | 0.02 |
| 2/18/21 | 0.02 |
| 2/19/21 | 0.02 |
| 2/22/21 | 0.021 |
| 2/23/21 | 0.02 |
| 2/24/21 | 0.021 |
| 2/25/21 | 0.019 |
| 2/26/21 | 0.021 |
| 3/1/21 | 0.02 |
| 3/2/21 | 0.021 |
| 3/3/21 | 0.021 |
| 3/4/21 | 0.02 |
| 3/5/21 | 0.019 |
| 3/8/21 | 0.018 |
| 3/9/21 | 0.018 |
| 3/10/21 | 0.018 |
| 3/11/21 | 0.018 |
| 3/12/21 | 0.017 |
| 3/15/21 | 0.016 |
| 3/16/21 | 0.016 |
| 3/17/21 | 0.017 |
| 3/18/21 | 0.016 |
| 3/19/21 | 0.016 |
| 3/22/21 | 0.016 |
| 3/23/21 | 0.016 |
| 3/24/21 | 0.016 |
| 3/25/21 | 0.016 |
| 3/26/21 | 0.016 |
| 3/29/21 | 0.015 |
| 3/30/21 | 0.015 |
| 3/31/21 | 0.015 |
| 4/1/21 | 0.015 |
| 4/5/21 | 0.014 |
| 4/6/21 | 0.015 |
| 4/7/21 | 0.015 |
| 4/8/21 | 0.015 |
| 4/9/21 | 0.015 |
| 4/12/21 | 0.015 |
| 4/13/21 | 0.015 |
| 4/14/21 | 0.015 |
| 4/15/21 | 0.015 |
| 4/16/21 | 0.015 |
| 4/19/21 | 0.015 |
| 4/20/21 | 0.014 |
| 4/21/21 | 0.015 |
| 4/22/21 | 0.015 |
| 4/23/21 | 0.015 |
| 4/26/21 | 0.015 |
| 4/27/21 | 0.015 |
| 4/28/21 | 0.015 |
| 4/29/21 | 0.014 |
| 4/30/21 | 0.014 |
| 5/3/21 | 0.015 |
| 5/4/21 | 0.015 |
| 5/5/21 | 0.016 |
| 5/6/21 | 0.015 |
| 5/7/21 | 0.015 |
| 5/10/21 | 0.015 |
| 5/11/21 | 0.015 |
| 5/12/21 | 0.015 |
| 5/13/21 | 0.015 |
| 5/14/21 | 0.015 |
| 5/17/21 | 0.015 |
| 5/18/21 | 0.015 |
| 5/19/21 | 0.015 |
| 5/20/21 | 0.015 |
| 5/21/21 | 0.015 |
| 5/24/21 | 0.015 |
| 5/25/21 | 0.016 |
| 5/26/21 | 0.016 |
| 5/27/21 | 0.016 |
| 5/28/21 | 0.016 |
| 6/1/21 | 0.016 |
| 6/2/21 | 0.016 |
| 6/3/21 | 0.015 |
| 6/4/21 | 0.016 |
| 6/7/21 | 0.016 |
| 6/8/21 | 0.016 |
| 6/9/21 | 0.016 |
| 6/10/21 | 0.017 |
| 6/11/21 | 0.016 |
| 6/14/21 | 0.016 |
| 6/15/21 | 0.016 |
| 6/16/21 | 0.016 |
| 6/17/21 | 0.016 |
| 6/18/21 | 0.018 |
| 6/21/21 | 0.017 |
| 6/22/21 | 0.017 |
| 6/23/21 | 0.017 |
| 6/24/21 | 0.018 |
| 6/25/21 | 0.017 |
| 6/28/21 | 0.017 |
| 6/29/21 | 0.018 |
| 6/30/21 | 0.018 |
| 7/1/21 | 0.017 |
| 7/2/21 | 0.018 |
| 7/6/21 | 0.018 |
| 7/7/21 | 0.019 |
| 7/8/21 | 0.019 |
| 7/9/21 | 0.018 |
| 7/12/21 | 0.018 |
| 7/13/21 | 0.018 |
| 7/14/21 | 0.018 |
| 7/15/21 | 0.018 |
| 7/16/21 | 0.018 |
| 7/19/21 | 0.02 |
| 7/20/21 | 0.019 |
| 7/21/21 | 0.019 |
| 7/22/21 | 0.019 |
| 7/23/21 | 0.018 |
| 7/26/21 | 0.019 |
| 7/27/21 | 0.018 |
| 7/28/21 | 0.018 |
| 7/29/21 | 0.018 |
| 7/30/21 | 0.019 |
| 8/2/21 | 0.019 |
| 8/3/21 | 0.019 |
| 8/4/21 | 0.019 |
| 8/5/21 | 0.018 |
| 8/6/21 | 0.018 |
| 8/9/21 | 0.017 |
| 8/10/21 | 0.017 |
| 8/11/21 | 0.017 |
| 8/12/21 | 0.017 |
| 8/13/21 | 0.017 |
| 8/16/21 | 0.017 |
| 8/17/21 | 0.017 |
| 8/18/21 | 0.018 |
| 8/19/21 | 0.018 |
| 8/20/21 | 0.017 |
| 8/23/21 | 0.018 |
| 8/24/21 | 0.017 |
| 8/25/21 | 0.017 |
| 8/26/21 | 0.017 |
| 8/27/21 | 0.017 |
| 8/30/21 | 0.018 |
| 8/31/21 | 0.017 |
| 9/1/21 | 0.017 |
| 9/2/21 | 0.017 |
| 9/3/21 | 0.016 |
| 9/7/21 | 0.016 |
| 9/8/21 | 0.016 |
| 9/9/21 | 0.017 |
| 9/10/21 | 0.017 |
| 9/13/21 | 0.017 |
| 9/14/21 | 0.018 |
| 9/15/21 | 0.018 |
| 9/16/21 | 0.017 |
| 9/17/21 | 0.018 |
| 9/20/21 | 0.018 |
| 9/21/21 | 0.018 |
| 9/22/21 | 0.018 |
| 9/23/21 | 0.018 |
| 9/24/21 | 0.017 |
| 9/27/21 | 0.017 |
| 9/28/21 | 0.017 |
| 9/29/21 | 0.016 |
| 9/30/21 | 0.017 |
| 10/1/21 | 0.018 |
| 10/4/21 | 0.017 |
| 10/5/21 | 0.016 |
| 10/6/21 | 0.016 |
| 10/7/21 | 0.016 |
| 10/8/21 | 0.016 |
| 10/11/21 | 0.016 |
| 10/12/21 | 0.016 |
| 10/13/21 | 0.016 |
| 10/14/21 | 0.016 |
| 10/15/21 | 0.016 |
| 10/18/21 | 0.016 |
| 10/19/21 | 0.015 |
| 10/20/21 | 0.014 |
| 10/21/21 | 0.014 |
| 10/22/21 | 0.014 |
| 10/25/21 | 0.014 |
| 10/26/21 | 0.014 |
| 10/27/21 | 0.015 |
| 10/28/21 | 0.015 |
| 10/29/21 | 0.015 |
| 11/1/21 | 0.015 |
| 11/2/21 | 0.015 |
| 11/3/21 | 0.015 |
| 11/4/21 | 0.016 |
| 11/5/21 | 0.016 |
| 11/8/21 | 0.016 |
| 11/9/21 | 0.016 |
| 11/10/21 | 0.015 |
| 11/12/21 | 0.015 |
| 11/15/21 | 0.015 |
| 11/16/21 | 0.015 |
| 11/17/21 | 0.015 |
| 11/18/21 | 0.015 |
| 11/19/21 | 0.015 |
| 11/22/21 | 0.015 |
| 11/23/21 | 0.014 |
| 11/24/21 | 0.014 |
| 11/26/21 | 0.016 |
| 11/29/21 | 0.016 |
| 11/30/21 | 0.018 |
| 12/1/21 | 0.017 |
| 12/2/21 | 0.017 |
| 12/3/21 | 0.017 |
| 12/6/21 | 0.016 |
| 12/7/21 | 0.015 |
| 12/8/21 | 0.015 |
| 12/9/21 | 0.016 |
| 12/10/21 | 0.015 |
| 12/13/21 | 0.016 |
| 12/14/21 | 0.016 |
| 12/15/21 | 0.015 |
| 12/16/21 | 0.015 |
| 12/17/21 | 0.016 |
| 12/20/21 | 0.016 |
| 12/21/21 | 0.015 |
| 12/22/21 | 0.015 |
| 12/23/21 | 0.015 |
| 12/27/21 | 0.015 |
| 12/28/21 | 0.014 |
| 12/29/21 | 0.014 |
| 12/30/21 | 0.014 |
| 12/31/21 | 0.014 |
| 1/3/22 | 0.013 |
| 1/4/22 | 0.013 |
| 1/5/22 | 0.012 |
| 1/6/22 | 0.012 |
| 1/7/22 | 0.012 |
| 1/10/22 | 0.012 |
| 1/11/22 | 0.012 |
| 1/12/22 | 0.013 |
| 1/13/22 | 0.013 |
| 1/14/22 | 0.012 |
| 1/18/22 | 0.012 |
| 1/19/22 | 0.012 |
| 1/20/22 | 0.012 |
| 1/21/22 | 0.013 |
| 1/24/22 | 0.013 |
| 1/25/22 | 0.013 |
| 1/26/22 | 0.013 |
| 1/27/22 | 0.013 |
| 1/28/22 | 0.013 |
| 1/31/22 | 0.012 |
| 2/1/22 | 0.012 |
| 2/2/22 | 0.012 |
| 2/3/22 | 0.012 |
| 2/4/22 | 0.011 |
| 2/7/22 | 0.011 |
| 2/8/22 | 0.011 |
| 2/9/22 | 0.011 |
| 2/10/22 | 0.011 |
| 2/11/22 | 0.012 |
| 2/14/22 | 0.012 |
| 2/15/22 | 0.011 |
| 2/16/22 | 0.011 |
| 2/17/22 | 0.012 |
| 2/18/22 | 0.012 |
| 2/22/22 | 0.012 |
| 2/23/22 | 0.012 |
| 2/24/22 | 0.012 |
| 2/25/22 | 0.011 |
| 2/28/22 | 0.013 |
| 3/1/22 | 0.014 |
| 3/2/22 | 0.012 |
| 3/3/22 | 0.012 |
| 3/4/22 | 0.012 |
| 3/7/22 | 0.012 |
| 3/8/22 | 0.011 |
| 3/9/22 | 0.011 |
| 3/10/22 | 0.01 |
| 3/11/22 | 0.01 |
| 3/14/22 | 0.008 |
| 3/15/22 | 0.008 |
| 3/16/22 | 0.008 |
| 3/17/22 | 0.008 |
| 3/18/22 | 0.008 |
| 3/21/22 | 0.006 |
| 3/22/22 | 0.006 |
| 3/23/22 | 0.006 |
| 3/24/22 | 0.006 |
| 3/25/22 | 0.004 |
| 3/28/22 | 0.004 |
| 3/29/22 | 0.004 |
| 3/30/22 | 0.005 |
| 3/31/22 | 0.005 |
| 4/1/22 | 0.004 |
| 4/4/22 | 0.004 |
| 4/5/22 | 0.002 |
| 4/6/22 | 0.001 |
| 4/7/22 | 0.001 |
| 4/8/22 | 0 |
| 4/11/22 | 0 |
| 4/12/22 | 0 |
| 4/13/22 | 0 |
| 4/14/22 | -0.001 |
| 4/18/22 | -0.001 |
| 4/19/22 | -0.002 |
| 4/20/22 | -0.001 |
| 4/21/22 | -0.001 |
| 4/22/22 | -0.001 |
| 4/25/22 | 0 |
| 4/26/22 | 0.001 |
| 4/27/22 | 0.001 |
| 4/28/22 | 0 |
| 4/29/22 | 0 |
| 5/2/22 | 0 |
| 5/3/22 | 0 |
| 5/4/22 | 0 |
| 5/5/22 | -0.001 |
| 5/6/22 | -0.002 |
| 5/9/22 | -0.001 |
| 5/10/22 | 0 |
| 5/11/22 | 0 |
| 5/12/22 | 0.001 |
| 5/13/22 | 0 |
| 5/16/22 | 0.001 |
| 5/17/22 | -0.001 |
| 5/18/22 | 0.001 |
| 5/19/22 | 0.001 |
| 5/20/22 | 0.002 |
| 5/23/22 | 0.001 |
| 5/24/22 | 0.001 |
| 5/25/22 | 0.001 |
| 5/26/22 | 0.001 |
| 5/27/22 | 0.001 |
| 5/31/22 | 0 |
| 6/1/22 | -0.001 |
| 6/2/22 | -0.001 |
| 6/3/22 | -0.001 |
| 6/6/22 | -0.002 |
| 6/7/22 | -0.001 |
| 6/8/22 | -0.001 |
| 6/9/22 | -0.001 |
| 6/10/22 | -0.002 |
| 6/13/22 | -0.003 |
| 6/14/22 | -0.003 |
| 6/15/22 | -0.001 |
| 6/16/22 | 0 |
| 6/17/22 | 0 |
| 6/21/22 | -0.001 |
| 6/22/22 | 0 |
| 6/23/22 | 0 |
| 6/24/22 | -0.001 |
| 6/27/22 | -0.002 |
| 6/28/22 | -0.002 |
| 6/29/22 | -0.001 |
| 6/30/22 | 0 |
| 7/1/22 | 0 |
| 7/5/22 | 0.002 |
| 7/6/22 | 0.001 |
| 7/7/22 | 0 |
| 7/8/22 | -0.001 |
| 7/11/22 | 0 |
| 7/12/22 | 0 |
| 7/13/22 | 0.001 |
| 7/14/22 | 0.001 |
| 7/15/22 | 0.001 |
| 7/18/22 | 0.001 |
| 7/19/22 | 0 |
| 7/20/22 | 0 |
| 7/21/22 | 0.002 |
| 7/22/22 | 0.003 |
| 7/25/22 | 0.002 |
| 7/26/22 | 0.002 |
| 7/27/22 | 0.002 |
| 7/28/22 | 0.002 |
| 7/29/22 | 0.002 |
| 8/1/22 | 0.002 |
| 8/2/22 | 0.001 |
| 8/3/22 | 0.001 |
| 8/4/22 | 0.002 |
| 8/5/22 | 0 |
| 8/8/22 | 0.001 |
| 8/9/22 | 0 |
| 8/10/22 | 0 |
| 8/11/22 | -0.001 |
| 8/12/22 | -0.001 |
| 8/15/22 | -0.001 |
| 8/16/22 | -0.001 |
| 8/17/22 | -0.002 |
| 8/18/22 | -0.001 |
| 8/19/22 | -0.002 |
| 8/22/22 | -0.003 |
| 8/23/22 | -0.003 |
| 8/24/22 | -0.003 |
| 8/25/22 | -0.003 |
| 8/26/22 | -0.002 |
| 8/29/22 | -0.003 |
| 8/30/22 | -0.003 |
| 8/31/22 | -0.003 |
| 9/1/22 | -0.004 |
| 9/2/22 | -0.003 |
| 9/6/22 | -0.005 |
| 9/7/22 | -0.005 |
| 9/8/22 | -0.005 |
| 9/9/22 | -0.006 |
| 9/12/22 | -0.006 |
| 9/13/22 | -0.006 |
| 9/14/22 | -0.006 |
| 9/15/22 | -0.006 |
| 9/16/22 | -0.006 |
| 9/19/22 | -0.007 |
| 9/20/22 | -0.007 |
| 9/21/22 | -0.006 |
| 9/22/22 | -0.008 |
| 9/23/22 | -0.007 |
| 9/26/22 | -0.009 |
| 9/27/22 | -0.009 |
| 9/28/22 | -0.007 |
| 9/29/22 | -0.006 |
| 9/30/22 | -0.006 |
| 10/3/22 | -0.006 |
| 10/4/22 | -0.006 |
| 10/5/22 | -0.007 |
| 10/6/22 | -0.006 |
| 10/7/22 | -0.006 |
| 10/10/22 | -0.006 |
| 10/11/22 | -0.007 |
| 10/12/22 | -0.005 |
| 10/13/22 | -0.007 |
| 10/14/22 | -0.007 |
| 10/17/22 | -0.007 |
| 10/18/22 | -0.008 |
| 10/19/22 | -0.009 |
| 10/20/22 | -0.009 |
| 10/21/22 | -0.009 |
| 10/24/22 | -0.01 |
| 10/25/22 | -0.009 |
| 10/26/22 | -0.008 |
| 10/27/22 | -0.008 |
| 10/28/22 | -0.009 |
| 10/31/22 | -0.01 |
| 11/1/22 | -0.01 |
| 11/2/22 | -0.01 |
| 11/3/22 | -0.01 |
| 11/4/22 | -0.011 |
| 11/7/22 | -0.011 |
| 11/8/22 | -0.01 |
| 11/9/22 | -0.01 |
| 11/10/22 | -0.008 |
| 11/14/22 | -0.008 |
| 11/15/22 | -0.007 |
| 11/16/22 | -0.006 |
| 11/17/22 | -0.007 |
| 11/18/22 | -0.008 |
| 11/21/22 | -0.008 |
| 11/22/22 | -0.008 |
| 11/23/22 | -0.007 |
| 11/25/22 | -0.007 |
| 11/28/22 | -0.007 |
| 11/29/22 | -0.007 |
| 11/30/22 | -0.007 |
| 12/1/22 | -0.006 |
| 12/2/22 | -0.005 |
| 12/5/22 | -0.006 |
| 12/6/22 | -0.005 |
| 12/7/22 | -0.004 |
| 12/8/22 | -0.005 |
| 12/9/22 | -0.006 |
| 12/12/22 | -0.007 |
| 12/13/22 | -0.006 |
| 12/14/22 | -0.006 |
| 12/15/22 | -0.005 |
| 12/16/22 | -0.005 |
| 12/19/22 | -0.006 |
| 12/20/22 | -0.007 |
| 12/21/22 | -0.007 |
| 12/22/22 | -0.007 |
| 12/23/22 | -0.008 |
| 12/27/22 | -0.009 |
| 12/28/22 | -0.009 |
| 12/29/22 | -0.009 |
| 12/30/22 | -0.009 |
| 1/3/23 | -0.008 |
| 1/4/23 | -0.008 |
| 1/5/23 | -0.007 |
| 1/6/23 | -0.006 |
| 1/9/23 | -0.006 |
| 1/10/23 | -0.007 |
| 1/11/23 | -0.006 |
| 1/12/23 | -0.005 |
| 1/13/23 | -0.006 |
| 1/17/23 | -0.006 |
| 1/18/23 | -0.004 |
| 1/19/23 | -0.004 |
| 1/20/23 | -0.005 |
| 1/23/23 | -0.005 |
| 1/24/23 | -0.005 |
| 1/25/23 | -0.004 |
| 1/26/23 | -0.005 |
| 1/27/23 | -0.005 |
| 1/30/23 | -0.005 |
| 1/31/23 | -0.005 |
| 2/1/23 | -0.004 |
| 2/2/23 | -0.004 |
| 2/3/23 | -0.004 |
| 2/6/23 | -0.006 |
| 2/7/23 | -0.006 |
| 2/8/23 | -0.005 |
| 2/9/23 | -0.005 |
| 2/10/23 | -0.006 |
| 2/13/23 | -0.006 |
| 2/14/23 | -0.007 |
| 2/15/23 | -0.007 |
| 2/16/23 | -0.007 |
| 2/17/23 | -0.007 |
| 2/21/23 | -0.008 |
| 2/22/23 | -0.008 |
| 2/23/23 | -0.007 |
| 2/24/23 | -0.008 |
| 2/27/23 | -0.007 |
| 2/28/23 | -0.007 |
| 3/1/23 | -0.007 |
| 3/2/23 | -0.008 |
| 3/3/23 | -0.008 |
| 3/6/23 | -0.008 |
| 3/7/23 | -0.007 |
| 3/8/23 | -0.008 |
| 3/9/23 | -0.007 |
| 3/10/23 | -0.004 |
| 3/13/23 | -0.003 |
| 3/14/23 | -0.004 |
| 3/15/23 | -0.003 |
| 3/16/23 | -0.004 |
| 3/17/23 | -0.002 |
| 3/20/23 | -0.003 |
| 3/21/23 | -0.004 |
| 3/22/23 | -0.002 |
| 3/23/23 | -0.001 |
| 3/24/23 | -0.002 |
| 3/27/23 | -0.003 |
| 3/28/23 | -0.003 |
| 3/29/23 | -0.004 |
| 3/30/23 | -0.004 |
| 3/31/23 | -0.003 |
| 4/3/23 | -0.003 |
| 4/4/23 | -0.002 |
| 4/5/23 | -0.002 |
| 4/6/23 | -0.003 |
| 4/10/23 | -0.004 |
| 4/11/23 | -0.004 |
| 4/12/23 | -0.004 |
| 4/13/23 | -0.004 |
| 4/14/23 | -0.004 |
| 4/17/23 | -0.005 |
| 4/18/23 | -0.005 |
| 4/19/23 | -0.006 |
| 4/20/23 | -0.005 |
| 4/21/23 | -0.005 |
| 4/24/23 | -0.005 |
| 4/25/23 | -0.004 |
| 4/26/23 | -0.003 |
| 4/27/23 | -0.005 |
| 4/28/23 | -0.004 |
| 5/1/23 | -0.005 |
| 5/2/23 | -0.003 |
| 5/3/23 | -0.003 |
| 5/4/23 | -0.003 |
| 5/5/23 | -0.004 |
| 5/8/23 | -0.004 |
| 5/9/23 | -0.004 |
| 5/10/23 | -0.004 |
| 5/11/23 | -0.003 |
| 5/12/23 | -0.004 |
| 5/15/23 | -0.004 |
| 5/16/23 | -0.003 |
| 5/17/23 | -0.003 |
| 5/18/23 | -0.004 |
| 5/19/23 | -0.005 |
| 5/22/23 | -0.005 |
| 5/23/23 | -0.004 |
| 5/24/23 | -0.005 |
| 5/25/23 | -0.005 |
| 5/26/23 | -0.005 |
| 5/30/23 | -0.003 |
| 5/31/23 | -0.003 |
| 6/1/23 | -0.003 |
| 6/2/23 | -0.004 |
| 6/5/23 | -0.004 |
| 6/6/23 | -0.004 |
| 6/7/23 | -0.005 |
| 6/8/23 | -0.005 |
| 6/9/23 | -0.005 |
| 6/12/23 | -0.005 |
| 6/13/23 | -0.006 |
| 6/14/23 | -0.006 |
| 6/15/23 | -0.005 |
| 6/16/23 | -0.005 |
| 6/20/23 | -0.005 |
| 6/21/23 | -0.005 |
| 6/22/23 | -0.005 |
| 6/23/23 | -0.004 |
| 6/26/23 | -0.005 |
| 6/27/23 | -0.005 |
| 6/28/23 | -0.004 |
| 6/29/23 | -0.005 |
| 6/30/23 | -0.005 |
| 7/3/23 | -0.006 |
| 7/5/23 | -0.007 |
| 7/6/23 | -0.008 |
| 7/7/23 | -0.008 |
| 7/10/23 | -0.007 |
| 7/11/23 | -0.007 |
| 7/12/23 | -0.006 |
| 7/13/23 | -0.006 |
| 7/14/23 | -0.006 |
| 7/17/23 | -0.006 |
| 7/18/23 | -0.005 |
| 7/19/23 | -0.005 |
| 7/20/23 | -0.007 |
| 7/21/23 | -0.007 |
| 7/24/23 | -0.007 |
| 7/25/23 | -0.008 |
| 7/26/23 | -0.007 |
| 7/27/23 | -0.008 |
| 7/28/23 | -0.008 |
| 7/31/23 | -0.008 |
| 8/1/23 | -0.008 |
| 8/2/23 | -0.008 |
| 8/3/23 | -0.009 |
| 8/4/23 | -0.007 |
| 8/7/23 | -0.007 |
| 8/8/23 | -0.007 |
| 8/9/23 | -0.006 |
| 8/10/23 | -0.007 |
| 8/11/23 | -0.008 |
| 8/14/23 | -0.008 |
| 8/15/23 | -0.008 |
| 8/16/23 | -0.009 |
| 8/17/23 | -0.009 |
| 8/18/23 | -0.008 |
| 8/21/23 | -0.009 |
| 8/22/23 | -0.009 |
| 8/23/23 | -0.008 |
| 8/24/23 | -0.008 |
| 8/25/23 | -0.008 |
| 8/28/23 | -0.008 |
| 8/29/23 | -0.007 |
| 8/30/23 | -0.007 |
| 8/31/23 | -0.006 |
| 9/1/23 | -0.007 |
| 9/5/23 | -0.007 |
| 9/6/23 | -0.008 |
| 9/7/23 | -0.008 |
| 9/8/23 | -0.008 |
| 9/11/23 | -0.008 |
| 9/12/23 | -0.008 |
| 9/13/23 | -0.008 |
| 9/14/23 | -0.009 |
| 9/15/23 | -0.01 |
| 9/18/23 | -0.01 |
| 9/19/23 | -0.01 |
| 9/20/23 | -0.01 |
| 9/21/23 | -0.011 |
| 9/22/23 | -0.01 |
| 9/25/23 | -0.011 |
| 9/26/23 | -0.01 |
| 9/27/23 | -0.01 |
| 9/28/23 | -0.009 |
| 9/29/23 | -0.009 |